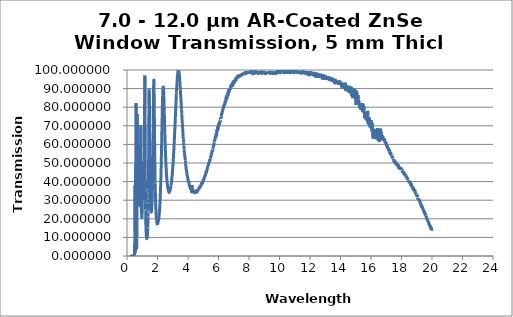
| Category | Transmission (%) |
|---|---|
| 0.2 | 0.006 |
| 0.201 | 0.006 |
| 0.202 | 0.005 |
| 0.203 | 0.004 |
| 0.204 | 0.001 |
| 0.205 | 0.002 |
| 0.206 | 0.003 |
| 0.207 | 0.002 |
| 0.208 | 0.004 |
| 0.209 | 0.002 |
| 0.21 | 0.001 |
| 0.211 | 0.003 |
| 0.212 | 0.003 |
| 0.213 | 0.003 |
| 0.214 | 0.004 |
| 0.215 | 0.002 |
| 0.216 | 0 |
| 0.217 | 0.002 |
| 0.218 | 0.004 |
| 0.219 | 0.003 |
| 0.22 | 0.004 |
| 0.221 | 0.002 |
| 0.222 | 0.001 |
| 0.223 | 0.001 |
| 0.224 | 0.001 |
| 0.225 | 0.001 |
| 0.226 | 0.003 |
| 0.227 | 0.002 |
| 0.228 | 0.001 |
| 0.229 | 0.001 |
| 0.23 | 0.003 |
| 0.231 | 0.004 |
| 0.232 | 0.004 |
| 0.233 | 0.001 |
| 0.234 | 0.001 |
| 0.235 | 0.001 |
| 0.236 | 0.002 |
| 0.237 | 0.002 |
| 0.238 | 0.004 |
| 0.239 | 0.001 |
| 0.24 | 0.002 |
| 0.241 | 0.001 |
| 0.242 | 0.002 |
| 0.243 | 0.002 |
| 0.244 | 0.004 |
| 0.245 | 0.001 |
| 0.246 | 0.001 |
| 0.247 | 0.001 |
| 0.248 | 0.003 |
| 0.249 | 0.003 |
| 0.25 | 0.004 |
| 0.251 | 0.001 |
| 0.252 | 0.001 |
| 0.253 | 0.001 |
| 0.254 | 0.001 |
| 0.255 | 0.002 |
| 0.256 | 0.004 |
| 0.257 | 0.001 |
| 0.258 | 0 |
| 0.259 | 0.001 |
| 0.26 | 0.003 |
| 0.261 | 0.004 |
| 0.262 | 0.004 |
| 0.263 | 0.002 |
| 0.264 | 0 |
| 0.265 | 0.002 |
| 0.266 | 0.002 |
| 0.267 | 0.002 |
| 0.268 | 0.003 |
| 0.269 | 0.001 |
| 0.27 | 0.001 |
| 0.271 | 0.001 |
| 0.272 | 0.001 |
| 0.273 | 0.003 |
| 0.274 | 0.003 |
| 0.275 | 0 |
| 0.276 | 0.002 |
| 0.277 | 0.001 |
| 0.278 | 0.002 |
| 0.279 | 0.003 |
| 0.28 | 0.003 |
| 0.281 | 0 |
| 0.282 | 0.001 |
| 0.283 | 0.001 |
| 0.284 | 0 |
| 0.285 | 0.002 |
| 0.286 | 0.003 |
| 0.287 | 0 |
| 0.288 | 0.001 |
| 0.289 | 0.001 |
| 0.29 | 0.001 |
| 0.291 | 0.002 |
| 0.292 | 0.002 |
| 0.293 | 0 |
| 0.294 | 0 |
| 0.295 | 0.001 |
| 0.296 | 0.001 |
| 0.297 | 0.002 |
| 0.298 | 0.003 |
| 0.299 | 0.002 |
| 0.3 | 0.001 |
| 0.301 | 0 |
| 0.302 | 0 |
| 0.303 | 0.003 |
| 0.304 | 0.003 |
| 0.305 | 0 |
| 0.306 | 0.001 |
| 0.307 | 0.001 |
| 0.308 | 0.001 |
| 0.309 | 0.003 |
| 0.31 | 0.003 |
| 0.311 | 0.001 |
| 0.312 | 0 |
| 0.313 | 0.001 |
| 0.314 | 0.001 |
| 0.315 | 0.002 |
| 0.316 | 0.003 |
| 0.317 | 0.002 |
| 0.318 | 0.001 |
| 0.319 | 0.001 |
| 0.32 | 0.002 |
| 0.321 | 0.002 |
| 0.322 | 0.003 |
| 0.323 | 0.003 |
| 0.324 | 0.001 |
| 0.325 | 0.001 |
| 0.326 | 0.002 |
| 0.327 | 0.003 |
| 0.328 | 0.004 |
| 0.329 | 0.003 |
| 0.33 | 0.001 |
| 0.331 | 0.001 |
| 0.332 | 0.002 |
| 0.333 | 0.003 |
| 0.334 | 0.003 |
| 0.335 | 0.003 |
| 0.336 | 0 |
| 0.337 | 0.002 |
| 0.338 | 0.002 |
| 0.339 | 0.002 |
| 0.34 | 0.003 |
| 0.341 | 0.003 |
| 0.342 | 0 |
| 0.343 | 0 |
| 0.344 | 0.002 |
| 0.345 | 0.003 |
| 0.346 | 0.003 |
| 0.347 | 0.002 |
| 0.348 | 0 |
| 0.349 | 0.001 |
| 0.35 | 0.002 |
| 0.351 | 0.003 |
| 0.352 | 0.003 |
| 0.353 | 0.003 |
| 0.354 | 0.001 |
| 0.355 | 0.001 |
| 0.356 | 0.001 |
| 0.357 | 0.003 |
| 0.358 | 0.003 |
| 0.359 | 0.003 |
| 0.36 | 0.001 |
| 0.361 | 0.002 |
| 0.362 | 0.001 |
| 0.363 | 0.001 |
| 0.364 | 0.002 |
| 0.365 | 0.002 |
| 0.366 | 0.001 |
| 0.367 | 0.001 |
| 0.368 | 0.002 |
| 0.369 | 0.002 |
| 0.37 | 0.001 |
| 0.371 | 0.002 |
| 0.372 | 0.001 |
| 0.373 | 0.001 |
| 0.374 | 0.001 |
| 0.375 | 0.001 |
| 0.376 | 0.001 |
| 0.377 | 0 |
| 0.378 | 0.001 |
| 0.379 | 0.002 |
| 0.38 | 0.002 |
| 0.381 | 0.002 |
| 0.382 | 0.002 |
| 0.383 | 0.003 |
| 0.384 | 0.003 |
| 0.385 | 0.001 |
| 0.386 | 0.002 |
| 0.387 | 0.002 |
| 0.388 | 0.003 |
| 0.389 | 0.002 |
| 0.39 | 0.004 |
| 0.391 | 0.001 |
| 0.392 | 0.003 |
| 0.393 | 0.002 |
| 0.394 | 0.002 |
| 0.395 | 0.004 |
| 0.396 | 0.001 |
| 0.397 | 0.001 |
| 0.398 | 0.002 |
| 0.399 | 0.003 |
| 0.4 | 0.003 |
| 0.401 | 0.004 |
| 0.402 | 0.003 |
| 0.403 | 0.001 |
| 0.404 | 0.002 |
| 0.405 | 0.003 |
| 0.406 | 0.002 |
| 0.407 | 0.004 |
| 0.408 | 0.002 |
| 0.409 | 0.002 |
| 0.41 | 0.001 |
| 0.411 | 0.003 |
| 0.412 | 0.003 |
| 0.413 | 0.004 |
| 0.414 | 0.003 |
| 0.415 | 0 |
| 0.416 | 0.003 |
| 0.417 | 0.003 |
| 0.418 | 0.003 |
| 0.419 | 0.001 |
| 0.42 | 0.002 |
| 0.421 | 0.003 |
| 0.422 | 0.003 |
| 0.423 | 0.003 |
| 0.424 | 0 |
| 0.425 | 0.003 |
| 0.426 | 0.003 |
| 0.427 | 0.003 |
| 0.428 | 0.002 |
| 0.429 | 0.001 |
| 0.43 | 0.003 |
| 0.431 | 0.001 |
| 0.432 | 0.003 |
| 0.433 | 0.003 |
| 0.434 | 0.003 |
| 0.435 | 0 |
| 0.436 | 0.002 |
| 0.437 | 0.002 |
| 0.438 | 0.003 |
| 0.439 | 0.002 |
| 0.44 | 0 |
| 0.441 | 0.001 |
| 0.442 | 0.003 |
| 0.443 | 0.003 |
| 0.444 | 0.003 |
| 0.445 | 0.003 |
| 0.446 | 0.001 |
| 0.447 | 0.001 |
| 0.448 | 0.003 |
| 0.449 | 0 |
| 0.45 | 0.005 |
| 0.451 | 0.003 |
| 0.452 | 0.001 |
| 0.453 | 0 |
| 0.454 | 0.002 |
| 0.455 | 0.003 |
| 0.456 | 0.001 |
| 0.457 | 0.003 |
| 0.458 | 0.003 |
| 0.459 | 0.001 |
| 0.46 | 0 |
| 0.461 | 0.002 |
| 0.462 | 0.002 |
| 0.463 | 0.003 |
| 0.464 | 0.004 |
| 0.465 | 0.001 |
| 0.466 | 0.001 |
| 0.467 | 0.002 |
| 0.468 | 0.001 |
| 0.469 | 0.003 |
| 0.47 | 0.003 |
| 0.471 | 0 |
| 0.472 | 0 |
| 0.473 | 0.002 |
| 0.474 | 0.002 |
| 0.475 | 0.005 |
| 0.476 | 0.03 |
| 0.477 | 0.09 |
| 0.478 | 0.181 |
| 0.479 | 0.305 |
| 0.48 | 0.431 |
| 0.481 | 0.544 |
| 0.482 | 0.633 |
| 0.483 | 0.702 |
| 0.484 | 0.751 |
| 0.485 | 0.799 |
| 0.486 | 0.851 |
| 0.487 | 0.924 |
| 0.488 | 1.026 |
| 0.489 | 1.175 |
| 0.49 | 1.38 |
| 0.491 | 1.66 |
| 0.492 | 2.038 |
| 0.493 | 2.54 |
| 0.494 | 3.173 |
| 0.495 | 3.955 |
| 0.496 | 4.812 |
| 0.497 | 5.629 |
| 0.498 | 6.212 |
| 0.499 | 6.403 |
| 0.5 | 6.164 |
| 0.501 | 5.6 |
| 0.502 | 4.881 |
| 0.503 | 4.153 |
| 0.504 | 3.496 |
| 0.505 | 2.946 |
| 0.506 | 2.516 |
| 0.507 | 2.196 |
| 0.508 | 1.962 |
| 0.509 | 1.806 |
| 0.51 | 1.718 |
| 0.511 | 1.685 |
| 0.512 | 1.708 |
| 0.513 | 1.79 |
| 0.514 | 1.932 |
| 0.515 | 2.153 |
| 0.516 | 2.486 |
| 0.517 | 2.969 |
| 0.518 | 3.67 |
| 0.519 | 4.672 |
| 0.52 | 6.086 |
| 0.521 | 8.087 |
| 0.522 | 10.86 |
| 0.523 | 14.652 |
| 0.524 | 19.672 |
| 0.525 | 25.767 |
| 0.526 | 32.054 |
| 0.527 | 36.795 |
| 0.528 | 37.983 |
| 0.529 | 35.077 |
| 0.53 | 29.457 |
| 0.531 | 23.232 |
| 0.532 | 17.824 |
| 0.533 | 13.575 |
| 0.534 | 10.411 |
| 0.535 | 8.117 |
| 0.536 | 6.443 |
| 0.537 | 5.235 |
| 0.538 | 4.359 |
| 0.539 | 3.716 |
| 0.54 | 3.243 |
| 0.541 | 2.895 |
| 0.542 | 2.649 |
| 0.543 | 2.47 |
| 0.544 | 2.347 |
| 0.545 | 2.268 |
| 0.546 | 2.231 |
| 0.547 | 2.227 |
| 0.548 | 2.268 |
| 0.549 | 2.345 |
| 0.55 | 2.46 |
| 0.551 | 2.614 |
| 0.552 | 2.818 |
| 0.553 | 3.072 |
| 0.554 | 3.394 |
| 0.555 | 3.802 |
| 0.556 | 4.319 |
| 0.557 | 4.956 |
| 0.558 | 5.762 |
| 0.559 | 6.773 |
| 0.56 | 8.029 |
| 0.561 | 9.621 |
| 0.562 | 11.665 |
| 0.563 | 14.076 |
| 0.564 | 17.033 |
| 0.565 | 20.629 |
| 0.566 | 24.969 |
| 0.567 | 29.857 |
| 0.568 | 35.098 |
| 0.569 | 40.227 |
| 0.57 | 44.566 |
| 0.571 | 47.628 |
| 0.572 | 49.14 |
| 0.573 | 49.115 |
| 0.574 | 47.881 |
| 0.575 | 45.866 |
| 0.576 | 43.441 |
| 0.577 | 40.967 |
| 0.578 | 38.719 |
| 0.579 | 36.822 |
| 0.58 | 35.337 |
| 0.581 | 34.315 |
| 0.582 | 33.724 |
| 0.583 | 33.555 |
| 0.584 | 33.825 |
| 0.585 | 34.541 |
| 0.586 | 35.776 |
| 0.587 | 37.576 |
| 0.588 | 39.992 |
| 0.589 | 43.087 |
| 0.59 | 46.945 |
| 0.591 | 51.562 |
| 0.592 | 56.856 |
| 0.593 | 62.759 |
| 0.594 | 68.961 |
| 0.595 | 74.911 |
| 0.596 | 79.765 |
| 0.597 | 82.272 |
| 0.598 | 81.669 |
| 0.599 | 77.803 |
| 0.6 | 71.18 |
| 0.601 | 63.029 |
| 0.602 | 54.594 |
| 0.603 | 46.466 |
| 0.604 | 39.169 |
| 0.605 | 32.933 |
| 0.606 | 27.648 |
| 0.607 | 23.298 |
| 0.608 | 19.774 |
| 0.609 | 16.899 |
| 0.61 | 14.567 |
| 0.611 | 12.699 |
| 0.612 | 11.179 |
| 0.613 | 9.924 |
| 0.614 | 8.885 |
| 0.615 | 8.012 |
| 0.616 | 7.278 |
| 0.617 | 6.659 |
| 0.618 | 6.137 |
| 0.619 | 5.704 |
| 0.62 | 5.346 |
| 0.621 | 5.048 |
| 0.622 | 4.806 |
| 0.623 | 4.609 |
| 0.624 | 4.446 |
| 0.625 | 4.316 |
| 0.626 | 4.217 |
| 0.627 | 4.146 |
| 0.628 | 4.107 |
| 0.629 | 4.094 |
| 0.63 | 4.1 |
| 0.631 | 4.134 |
| 0.632 | 4.193 |
| 0.633 | 4.273 |
| 0.634 | 4.381 |
| 0.635 | 4.517 |
| 0.636 | 4.682 |
| 0.637 | 4.88 |
| 0.638 | 5.113 |
| 0.639 | 5.382 |
| 0.64 | 5.69 |
| 0.641 | 6.044 |
| 0.642 | 6.439 |
| 0.643 | 6.889 |
| 0.644 | 7.404 |
| 0.645 | 7.99 |
| 0.646 | 8.667 |
| 0.647 | 9.443 |
| 0.648 | 10.326 |
| 0.649 | 11.329 |
| 0.65 | 12.467 |
| 0.651 | 13.737 |
| 0.652 | 15.154 |
| 0.653 | 16.756 |
| 0.654 | 18.578 |
| 0.655 | 20.654 |
| 0.656 | 22.999 |
| 0.657 | 25.643 |
| 0.658 | 28.604 |
| 0.659 | 31.864 |
| 0.66 | 35.425 |
| 0.661 | 39.256 |
| 0.662 | 43.249 |
| 0.663 | 47.378 |
| 0.664 | 51.669 |
| 0.665 | 56.009 |
| 0.666 | 60.218 |
| 0.667 | 64.193 |
| 0.668 | 67.758 |
| 0.669 | 70.726 |
| 0.67 | 73.103 |
| 0.671 | 74.819 |
| 0.672 | 75.867 |
| 0.673 | 76.372 |
| 0.674 | 76.359 |
| 0.675 | 75.852 |
| 0.676 | 75.042 |
| 0.677 | 73.971 |
| 0.678 | 72.678 |
| 0.679 | 71.33 |
| 0.68 | 69.934 |
| 0.681 | 68.517 |
| 0.682 | 67.189 |
| 0.683 | 65.935 |
| 0.684 | 64.729 |
| 0.685 | 63.616 |
| 0.686 | 62.559 |
| 0.687 | 61.517 |
| 0.688 | 60.586 |
| 0.689 | 59.727 |
| 0.69 | 58.919 |
| 0.691 | 58.162 |
| 0.692 | 57.437 |
| 0.693 | 56.725 |
| 0.694 | 56.01 |
| 0.695 | 55.306 |
| 0.696 | 54.591 |
| 0.697 | 53.804 |
| 0.698 | 53.015 |
| 0.699 | 52.192 |
| 0.7 | 51.31 |
| 0.701 | 50.432 |
| 0.702 | 49.54 |
| 0.703 | 48.583 |
| 0.704 | 47.609 |
| 0.705 | 46.595 |
| 0.706 | 45.519 |
| 0.707 | 44.463 |
| 0.708 | 43.407 |
| 0.709 | 42.323 |
| 0.71 | 41.275 |
| 0.711 | 40.25 |
| 0.712 | 39.251 |
| 0.713 | 38.296 |
| 0.714 | 37.368 |
| 0.715 | 36.433 |
| 0.716 | 35.555 |
| 0.717 | 34.721 |
| 0.718 | 33.907 |
| 0.719 | 33.173 |
| 0.72 | 32.488 |
| 0.721 | 31.852 |
| 0.722 | 31.277 |
| 0.723 | 30.755 |
| 0.724 | 30.266 |
| 0.725 | 29.835 |
| 0.726 | 29.452 |
| 0.727 | 29.102 |
| 0.728 | 28.824 |
| 0.729 | 28.582 |
| 0.73 | 28.391 |
| 0.731 | 28.266 |
| 0.732 | 28.172 |
| 0.733 | 28.129 |
| 0.734 | 28.135 |
| 0.735 | 28.184 |
| 0.736 | 28.28 |
| 0.737 | 28.434 |
| 0.738 | 28.631 |
| 0.739 | 28.865 |
| 0.74 | 29.166 |
| 0.741 | 29.497 |
| 0.742 | 29.866 |
| 0.743 | 30.305 |
| 0.744 | 30.77 |
| 0.745 | 31.289 |
| 0.746 | 31.878 |
| 0.747 | 32.512 |
| 0.748 | 33.189 |
| 0.749 | 33.921 |
| 0.75 | 34.686 |
| 0.751 | 35.478 |
| 0.752 | 36.317 |
| 0.753 | 37.188 |
| 0.754 | 38.099 |
| 0.755 | 39.072 |
| 0.756 | 40.078 |
| 0.757 | 41.089 |
| 0.758 | 42.149 |
| 0.759 | 43.209 |
| 0.76 | 44.255 |
| 0.761 | 45.332 |
| 0.762 | 46.356 |
| 0.763 | 47.341 |
| 0.764 | 48.327 |
| 0.765 | 49.278 |
| 0.766 | 50.182 |
| 0.767 | 51.032 |
| 0.768 | 51.812 |
| 0.769 | 52.498 |
| 0.77 | 53.122 |
| 0.771 | 53.627 |
| 0.772 | 54.011 |
| 0.773 | 54.317 |
| 0.774 | 54.526 |
| 0.775 | 54.603 |
| 0.776 | 54.622 |
| 0.777 | 54.519 |
| 0.778 | 54.304 |
| 0.779 | 54.016 |
| 0.78 | 53.639 |
| 0.781 | 53.186 |
| 0.782 | 52.676 |
| 0.783 | 52.128 |
| 0.784 | 51.501 |
| 0.785 | 50.851 |
| 0.786 | 50.13 |
| 0.787 | 49.374 |
| 0.788 | 48.649 |
| 0.789 | 47.866 |
| 0.79 | 47.059 |
| 0.791 | 46.32 |
| 0.792 | 45.564 |
| 0.793 | 44.796 |
| 0.794 | 44.075 |
| 0.795 | 43.306 |
| 0.796 | 42.569 |
| 0.797 | 41.866 |
| 0.798 | 41.142 |
| 0.799 | 40.46 |
| 0.8 | 39.821 |
| 0.801 | 39.182 |
| 0.802 | 38.584 |
| 0.803 | 38 |
| 0.804 | 37.433 |
| 0.805 | 36.885 |
| 0.806 | 36.362 |
| 0.807 | 35.846 |
| 0.808 | 35.342 |
| 0.809 | 34.872 |
| 0.81 | 34.399 |
| 0.811 | 33.966 |
| 0.812 | 33.566 |
| 0.813 | 33.168 |
| 0.814 | 32.787 |
| 0.815 | 32.407 |
| 0.816 | 32.054 |
| 0.817 | 31.717 |
| 0.818 | 31.379 |
| 0.819 | 31.065 |
| 0.82 | 30.775 |
| 0.821 | 30.479 |
| 0.822 | 30.2 |
| 0.823 | 29.935 |
| 0.824 | 29.702 |
| 0.825 | 29.453 |
| 0.826 | 29.225 |
| 0.827 | 28.983 |
| 0.828 | 28.771 |
| 0.829 | 28.577 |
| 0.83 | 28.393 |
| 0.831 | 28.226 |
| 0.832 | 28.046 |
| 0.833 | 27.876 |
| 0.834 | 27.712 |
| 0.835 | 27.601 |
| 0.836 | 27.486 |
| 0.837 | 27.369 |
| 0.838 | 27.272 |
| 0.839 | 27.18 |
| 0.84 | 27.112 |
| 0.841 | 27.043 |
| 0.842 | 27.002 |
| 0.843 | 26.946 |
| 0.844 | 26.932 |
| 0.845 | 26.941 |
| 0.846 | 26.922 |
| 0.847 | 26.923 |
| 0.848 | 26.988 |
| 0.849 | 27.033 |
| 0.85 | 27.102 |
| 0.851 | 27.197 |
| 0.852 | 27.273 |
| 0.853 | 27.389 |
| 0.854 | 27.575 |
| 0.855 | 27.712 |
| 0.856 | 27.878 |
| 0.857 | 28.088 |
| 0.858 | 28.306 |
| 0.859 | 28.589 |
| 0.86 | 29.36 |
| 0.861 | 29.655 |
| 0.862 | 29.957 |
| 0.863 | 30.309 |
| 0.864 | 30.688 |
| 0.865 | 31.112 |
| 0.866 | 31.592 |
| 0.867 | 32.101 |
| 0.868 | 32.616 |
| 0.869 | 33.11 |
| 0.87 | 33.713 |
| 0.871 | 34.322 |
| 0.872 | 35.004 |
| 0.873 | 35.699 |
| 0.874 | 36.446 |
| 0.875 | 37.212 |
| 0.876 | 38.054 |
| 0.877 | 38.917 |
| 0.878 | 39.877 |
| 0.879 | 40.814 |
| 0.88 | 41.828 |
| 0.881 | 42.865 |
| 0.882 | 43.969 |
| 0.883 | 45.105 |
| 0.884 | 46.31 |
| 0.885 | 47.526 |
| 0.886 | 48.785 |
| 0.887 | 50.078 |
| 0.888 | 51.287 |
| 0.889 | 52.593 |
| 0.89 | 53.976 |
| 0.891 | 55.303 |
| 0.892 | 56.677 |
| 0.893 | 58.054 |
| 0.894 | 59.421 |
| 0.895 | 60.694 |
| 0.896 | 62 |
| 0.897 | 63.212 |
| 0.898 | 64.428 |
| 0.899 | 65.543 |
| 0.9 | 66.614 |
| 0.901 | 67.49 |
| 0.902 | 68.332 |
| 0.903 | 69.046 |
| 0.904 | 69.587 |
| 0.905 | 70 |
| 0.906 | 70.261 |
| 0.907 | 70.366 |
| 0.908 | 70.293 |
| 0.909 | 70.018 |
| 0.91 | 69.578 |
| 0.911 | 69.008 |
| 0.912 | 68.238 |
| 0.913 | 67.296 |
| 0.914 | 66.308 |
| 0.915 | 65.15 |
| 0.916 | 63.803 |
| 0.917 | 62.527 |
| 0.918 | 61.103 |
| 0.919 | 59.551 |
| 0.92 | 58.065 |
| 0.921 | 56.506 |
| 0.922 | 54.924 |
| 0.923 | 53.313 |
| 0.924 | 51.777 |
| 0.925 | 50.235 |
| 0.926 | 48.803 |
| 0.927 | 47.344 |
| 0.928 | 45.825 |
| 0.929 | 44.477 |
| 0.93 | 43.199 |
| 0.931 | 41.947 |
| 0.932 | 40.672 |
| 0.933 | 39.516 |
| 0.934 | 38.322 |
| 0.935 | 37.205 |
| 0.936 | 36.18 |
| 0.937 | 35.21 |
| 0.938 | 34.255 |
| 0.939 | 33.314 |
| 0.94 | 32.445 |
| 0.941 | 31.64 |
| 0.942 | 30.827 |
| 0.943 | 30.095 |
| 0.944 | 29.336 |
| 0.945 | 28.648 |
| 0.946 | 28.026 |
| 0.947 | 27.424 |
| 0.948 | 26.818 |
| 0.949 | 26.275 |
| 0.95 | 25.764 |
| 0.951 | 25.282 |
| 0.952 | 24.817 |
| 0.953 | 24.388 |
| 0.954 | 23.979 |
| 0.955 | 23.623 |
| 0.956 | 23.275 |
| 0.957 | 22.969 |
| 0.958 | 22.653 |
| 0.959 | 22.367 |
| 0.96 | 22.128 |
| 0.961 | 21.887 |
| 0.962 | 21.67 |
| 0.963 | 21.49 |
| 0.964 | 21.322 |
| 0.965 | 21.143 |
| 0.966 | 20.996 |
| 0.967 | 20.889 |
| 0.968 | 20.82 |
| 0.969 | 20.752 |
| 0.97 | 20.66 |
| 0.971 | 20.598 |
| 0.972 | 20.57 |
| 0.973 | 20.565 |
| 0.974 | 20.551 |
| 0.975 | 20.571 |
| 0.976 | 20.608 |
| 0.977 | 20.635 |
| 0.978 | 20.681 |
| 0.979 | 20.753 |
| 0.98 | 20.85 |
| 0.981 | 20.931 |
| 0.982 | 21.032 |
| 0.983 | 21.172 |
| 0.984 | 21.342 |
| 0.985 | 21.497 |
| 0.986 | 21.662 |
| 0.987 | 21.866 |
| 0.988 | 22.097 |
| 0.989 | 22.304 |
| 0.99 | 22.535 |
| 0.991 | 22.779 |
| 0.992 | 23.079 |
| 0.993 | 23.403 |
| 0.994 | 23.701 |
| 0.995 | 24.038 |
| 0.996 | 24.413 |
| 0.997 | 24.775 |
| 0.998 | 25.159 |
| 0.999 | 25.555 |
| 1.0 | 25.997 |
| 1.001 | 26.463 |
| 1.002 | 26.903 |
| 1.003 | 27.365 |
| 1.004 | 27.845 |
| 1.005 | 28.342 |
| 1.006 | 28.887 |
| 1.007 | 29.461 |
| 1.008 | 30.014 |
| 1.009 | 30.582 |
| 1.01 | 31.171 |
| 1.011 | 31.771 |
| 1.012 | 32.413 |
| 1.013 | 33.069 |
| 1.014 | 33.709 |
| 1.015 | 34.366 |
| 1.016 | 35.025 |
| 1.017 | 35.704 |
| 1.018 | 36.436 |
| 1.019 | 37.159 |
| 1.02 | 37.865 |
| 1.021 | 38.601 |
| 1.022 | 39.33 |
| 1.023 | 40.05 |
| 1.024 | 40.794 |
| 1.025 | 41.547 |
| 1.026 | 42.27 |
| 1.027 | 42.971 |
| 1.028 | 43.653 |
| 1.029 | 44.327 |
| 1.03 | 44.973 |
| 1.031 | 45.624 |
| 1.032 | 46.27 |
| 1.033 | 46.84 |
| 1.034 | 47.383 |
| 1.035 | 47.889 |
| 1.036 | 48.345 |
| 1.037 | 48.773 |
| 1.038 | 49.174 |
| 1.039 | 49.488 |
| 1.04 | 49.743 |
| 1.041 | 49.976 |
| 1.042 | 50.153 |
| 1.043 | 50.274 |
| 1.044 | 50.354 |
| 1.045 | 50.385 |
| 1.046 | 50.374 |
| 1.047 | 50.306 |
| 1.048 | 50.179 |
| 1.049 | 50.02 |
| 1.05 | 49.82 |
| 1.051 | 49.581 |
| 1.052 | 49.317 |
| 1.053 | 49.025 |
| 1.054 | 48.698 |
| 1.055 | 48.321 |
| 1.056 | 47.923 |
| 1.057 | 47.534 |
| 1.058 | 47.13 |
| 1.059 | 46.699 |
| 1.06 | 46.239 |
| 1.061 | 45.757 |
| 1.062 | 45.278 |
| 1.063 | 44.799 |
| 1.064 | 44.315 |
| 1.065 | 43.821 |
| 1.066 | 43.319 |
| 1.067 | 42.835 |
| 1.068 | 42.376 |
| 1.069 | 41.905 |
| 1.07 | 41.432 |
| 1.071 | 40.971 |
| 1.072 | 40.513 |
| 1.073 | 40.056 |
| 1.074 | 39.621 |
| 1.075 | 39.194 |
| 1.076 | 38.802 |
| 1.077 | 38.436 |
| 1.078 | 38.075 |
| 1.079 | 37.719 |
| 1.08 | 37.381 |
| 1.081 | 37.046 |
| 1.082 | 36.74 |
| 1.083 | 36.454 |
| 1.084 | 36.17 |
| 1.085 | 35.918 |
| 1.086 | 35.725 |
| 1.087 | 35.525 |
| 1.088 | 35.327 |
| 1.089 | 35.145 |
| 1.09 | 34.985 |
| 1.091 | 34.835 |
| 1.092 | 34.7 |
| 1.093 | 34.587 |
| 1.094 | 34.508 |
| 1.095 | 34.463 |
| 1.096 | 34.424 |
| 1.097 | 34.379 |
| 1.098 | 34.358 |
| 1.099 | 34.358 |
| 1.1 | 34.375 |
| 1.101 | 34.4 |
| 1.102 | 34.454 |
| 1.103 | 34.524 |
| 1.104 | 34.649 |
| 1.105 | 34.781 |
| 1.106 | 34.93 |
| 1.107 | 35.091 |
| 1.108 | 35.268 |
| 1.109 | 35.467 |
| 1.11 | 35.683 |
| 1.111 | 35.935 |
| 1.112 | 36.217 |
| 1.113 | 36.517 |
| 1.114 | 36.83 |
| 1.115 | 37.173 |
| 1.116 | 37.588 |
| 1.117 | 38.013 |
| 1.118 | 38.433 |
| 1.119 | 38.888 |
| 1.12 | 39.386 |
| 1.121 | 39.911 |
| 1.122 | 40.445 |
| 1.123 | 41.016 |
| 1.124 | 41.617 |
| 1.125 | 42.25 |
| 1.126 | 42.906 |
| 1.127 | 43.638 |
| 1.128 | 44.385 |
| 1.129 | 45.158 |
| 1.13 | 45.9 |
| 1.131 | 46.713 |
| 1.132 | 47.606 |
| 1.133 | 48.503 |
| 1.134 | 49.493 |
| 1.135 | 50.51 |
| 1.136 | 51.497 |
| 1.137 | 52.665 |
| 1.138 | 53.82 |
| 1.139 | 54.995 |
| 1.14 | 56.219 |
| 1.141 | 57.499 |
| 1.142 | 58.798 |
| 1.143 | 60.19 |
| 1.144 | 61.611 |
| 1.145 | 63.072 |
| 1.146 | 64.617 |
| 1.147 | 66.192 |
| 1.148 | 67.785 |
| 1.149 | 69.454 |
| 1.15 | 71.114 |
| 1.151 | 72.855 |
| 1.152 | 74.542 |
| 1.153 | 76.382 |
| 1.154 | 78.135 |
| 1.155 | 79.929 |
| 1.156 | 81.637 |
| 1.157 | 83.407 |
| 1.158 | 85.074 |
| 1.159 | 86.713 |
| 1.16 | 88.26 |
| 1.161 | 89.76 |
| 1.162 | 91.138 |
| 1.163 | 92.455 |
| 1.164 | 93.576 |
| 1.165 | 94.604 |
| 1.166 | 95.457 |
| 1.167 | 96.142 |
| 1.168 | 96.641 |
| 1.169 | 96.955 |
| 1.17 | 97.097 |
| 1.171 | 97.033 |
| 1.172 | 96.763 |
| 1.173 | 96.339 |
| 1.174 | 95.718 |
| 1.175 | 94.866 |
| 1.176 | 93.875 |
| 1.177 | 92.699 |
| 1.178 | 91.376 |
| 1.179 | 89.889 |
| 1.18 | 88.308 |
| 1.181 | 86.561 |
| 1.182 | 84.708 |
| 1.183 | 82.734 |
| 1.184 | 80.757 |
| 1.185 | 78.643 |
| 1.186 | 76.541 |
| 1.187 | 74.318 |
| 1.188 | 72.189 |
| 1.189 | 70.066 |
| 1.19 | 67.76 |
| 1.191 | 65.567 |
| 1.192 | 63.547 |
| 1.193 | 61.414 |
| 1.194 | 59.406 |
| 1.195 | 57.401 |
| 1.196 | 55.486 |
| 1.197 | 53.562 |
| 1.198 | 51.709 |
| 1.199 | 50.003 |
| 1.2 | 48.257 |
| 1.201 | 46.554 |
| 1.202 | 45.089 |
| 1.203 | 43.502 |
| 1.204 | 42.137 |
| 1.205 | 40.716 |
| 1.206 | 39.386 |
| 1.207 | 38.119 |
| 1.208 | 36.936 |
| 1.209 | 35.755 |
| 1.21 | 34.681 |
| 1.211 | 33.603 |
| 1.212 | 32.579 |
| 1.213 | 31.599 |
| 1.214 | 30.665 |
| 1.215 | 29.749 |
| 1.216 | 28.935 |
| 1.217 | 28.053 |
| 1.218 | 27.263 |
| 1.219 | 26.528 |
| 1.22 | 25.834 |
| 1.221 | 25.075 |
| 1.222 | 24.411 |
| 1.223 | 23.758 |
| 1.224 | 23.142 |
| 1.225 | 22.541 |
| 1.226 | 21.976 |
| 1.227 | 21.415 |
| 1.228 | 20.899 |
| 1.229 | 20.381 |
| 1.23 | 19.919 |
| 1.231 | 19.449 |
| 1.232 | 18.982 |
| 1.233 | 18.557 |
| 1.234 | 18.152 |
| 1.235 | 17.733 |
| 1.236 | 17.361 |
| 1.237 | 17.014 |
| 1.238 | 16.665 |
| 1.239 | 16.318 |
| 1.24 | 15.986 |
| 1.241 | 15.693 |
| 1.242 | 15.409 |
| 1.243 | 15.12 |
| 1.244 | 14.855 |
| 1.245 | 14.598 |
| 1.246 | 14.353 |
| 1.247 | 14.113 |
| 1.248 | 13.888 |
| 1.249 | 13.661 |
| 1.25 | 13.409 |
| 1.251 | 13.217 |
| 1.252 | 13.015 |
| 1.253 | 12.838 |
| 1.254 | 12.656 |
| 1.255 | 12.445 |
| 1.256 | 12.298 |
| 1.257 | 12.143 |
| 1.258 | 12.013 |
| 1.259 | 11.861 |
| 1.26 | 11.707 |
| 1.261 | 11.536 |
| 1.262 | 11.418 |
| 1.263 | 11.303 |
| 1.264 | 11.186 |
| 1.265 | 11.057 |
| 1.266 | 10.91 |
| 1.267 | 10.809 |
| 1.268 | 10.708 |
| 1.269 | 10.613 |
| 1.27 | 10.523 |
| 1.271 | 10.441 |
| 1.272 | 10.355 |
| 1.273 | 10.271 |
| 1.274 | 10.19 |
| 1.275 | 10.104 |
| 1.276 | 10.038 |
| 1.277 | 9.955 |
| 1.278 | 9.892 |
| 1.279 | 9.847 |
| 1.28 | 9.832 |
| 1.281 | 9.767 |
| 1.282 | 9.719 |
| 1.283 | 9.663 |
| 1.284 | 9.618 |
| 1.285 | 9.568 |
| 1.286 | 9.531 |
| 1.287 | 9.499 |
| 1.288 | 9.463 |
| 1.289 | 9.427 |
| 1.29 | 9.401 |
| 1.291 | 9.37 |
| 1.292 | 9.349 |
| 1.293 | 9.337 |
| 1.294 | 9.32 |
| 1.295 | 9.308 |
| 1.296 | 9.298 |
| 1.297 | 9.289 |
| 1.298 | 9.293 |
| 1.299 | 9.296 |
| 1.3 | 9.304 |
| 1.301 | 9.293 |
| 1.302 | 9.275 |
| 1.303 | 9.285 |
| 1.304 | 9.309 |
| 1.305 | 9.339 |
| 1.306 | 9.36 |
| 1.307 | 9.357 |
| 1.308 | 9.348 |
| 1.309 | 9.372 |
| 1.31 | 9.412 |
| 1.311 | 9.459 |
| 1.312 | 9.497 |
| 1.313 | 9.547 |
| 1.314 | 9.589 |
| 1.315 | 9.604 |
| 1.316 | 9.618 |
| 1.317 | 9.669 |
| 1.318 | 9.718 |
| 1.319 | 9.771 |
| 1.32 | 9.825 |
| 1.321 | 9.886 |
| 1.322 | 9.953 |
| 1.323 | 10.01 |
| 1.324 | 10.072 |
| 1.325 | 10.138 |
| 1.326 | 10.211 |
| 1.327 | 10.284 |
| 1.328 | 10.37 |
| 1.329 | 10.459 |
| 1.33 | 10.545 |
| 1.331 | 10.637 |
| 1.332 | 10.71 |
| 1.333 | 10.767 |
| 1.334 | 10.866 |
| 1.335 | 10.976 |
| 1.336 | 11.085 |
| 1.337 | 11.186 |
| 1.338 | 11.276 |
| 1.339 | 11.369 |
| 1.34 | 11.5 |
| 1.341 | 11.639 |
| 1.342 | 11.785 |
| 1.343 | 11.928 |
| 1.344 | 12.048 |
| 1.345 | 12.146 |
| 1.346 | 12.297 |
| 1.347 | 12.492 |
| 1.348 | 12.674 |
| 1.349 | 12.804 |
| 1.35 | 12.916 |
| 1.351 | 13.057 |
| 1.352 | 13.231 |
| 1.353 | 13.473 |
| 1.354 | 13.745 |
| 1.355 | 13.976 |
| 1.356 | 14.143 |
| 1.357 | 14.26 |
| 1.358 | 14.361 |
| 1.359 | 14.532 |
| 1.36 | 14.846 |
| 1.361 | 15.221 |
| 1.362 | 15.494 |
| 1.363 | 15.694 |
| 1.364 | 15.934 |
| 1.365 | 16.177 |
| 1.366 | 16.445 |
| 1.367 | 16.739 |
| 1.368 | 17.024 |
| 1.369 | 17.308 |
| 1.37 | 17.646 |
| 1.371 | 18.022 |
| 1.372 | 18.34 |
| 1.373 | 18.64 |
| 1.374 | 18.991 |
| 1.375 | 19.372 |
| 1.376 | 19.716 |
| 1.377 | 19.989 |
| 1.378 | 20.235 |
| 1.379 | 20.598 |
| 1.38 | 21.057 |
| 1.381 | 21.571 |
| 1.382 | 22.129 |
| 1.383 | 22.647 |
| 1.384 | 23.063 |
| 1.385 | 23.466 |
| 1.386 | 23.975 |
| 1.387 | 24.606 |
| 1.388 | 25.235 |
| 1.389 | 25.75 |
| 1.39 | 26.228 |
| 1.391 | 26.796 |
| 1.392 | 27.404 |
| 1.393 | 28.027 |
| 1.394 | 28.783 |
| 1.395 | 29.632 |
| 1.396 | 30.3 |
| 1.397 | 30.868 |
| 1.398 | 31.56 |
| 1.399 | 32.444 |
| 1.4 | 33.407 |
| 1.401 | 34.168 |
| 1.402 | 34.893 |
| 1.403 | 35.778 |
| 1.404 | 36.718 |
| 1.405 | 37.662 |
| 1.406 | 38.587 |
| 1.407 | 39.535 |
| 1.408 | 40.567 |
| 1.409 | 41.621 |
| 1.41 | 42.593 |
| 1.411 | 43.596 |
| 1.412 | 44.648 |
| 1.413 | 45.793 |
| 1.414 | 47.001 |
| 1.415 | 48.153 |
| 1.416 | 49.338 |
| 1.417 | 50.592 |
| 1.418 | 51.872 |
| 1.419 | 53.174 |
| 1.42 | 54.484 |
| 1.421 | 55.768 |
| 1.422 | 57.117 |
| 1.423 | 58.53 |
| 1.424 | 59.928 |
| 1.425 | 61.341 |
| 1.426 | 62.776 |
| 1.427 | 64.215 |
| 1.428 | 65.634 |
| 1.429 | 67.068 |
| 1.43 | 68.54 |
| 1.431 | 70.012 |
| 1.432 | 71.461 |
| 1.433 | 72.868 |
| 1.434 | 74.266 |
| 1.435 | 75.634 |
| 1.436 | 76.967 |
| 1.437 | 78.251 |
| 1.438 | 79.495 |
| 1.439 | 80.666 |
| 1.44 | 81.793 |
| 1.441 | 82.853 |
| 1.442 | 83.847 |
| 1.443 | 84.795 |
| 1.444 | 85.653 |
| 1.445 | 86.423 |
| 1.446 | 87.113 |
| 1.447 | 87.665 |
| 1.448 | 88.158 |
| 1.449 | 88.583 |
| 1.45 | 88.885 |
| 1.451 | 89.125 |
| 1.452 | 89.263 |
| 1.453 | 89.312 |
| 1.454 | 89.274 |
| 1.455 | 89.12 |
| 1.456 | 88.908 |
| 1.457 | 88.597 |
| 1.458 | 88.199 |
| 1.459 | 87.751 |
| 1.46 | 87.198 |
| 1.461 | 86.569 |
| 1.462 | 85.882 |
| 1.463 | 85.112 |
| 1.464 | 84.282 |
| 1.465 | 83.426 |
| 1.466 | 82.495 |
| 1.467 | 81.523 |
| 1.468 | 80.495 |
| 1.469 | 79.454 |
| 1.47 | 78.37 |
| 1.471 | 77.253 |
| 1.472 | 76.099 |
| 1.473 | 74.979 |
| 1.474 | 73.794 |
| 1.475 | 72.627 |
| 1.476 | 71.428 |
| 1.477 | 70.253 |
| 1.478 | 69.101 |
| 1.479 | 67.945 |
| 1.48 | 66.781 |
| 1.481 | 65.623 |
| 1.482 | 64.482 |
| 1.483 | 63.357 |
| 1.484 | 62.242 |
| 1.485 | 61.171 |
| 1.486 | 60.12 |
| 1.487 | 59.094 |
| 1.488 | 58.07 |
| 1.489 | 57.087 |
| 1.49 | 56.099 |
| 1.491 | 55.145 |
| 1.492 | 54.219 |
| 1.493 | 53.296 |
| 1.494 | 52.376 |
| 1.495 | 51.531 |
| 1.496 | 50.639 |
| 1.497 | 49.782 |
| 1.498 | 48.971 |
| 1.499 | 48.165 |
| 1.5 | 47.384 |
| 1.501 | 46.628 |
| 1.502 | 45.88 |
| 1.503 | 45.164 |
| 1.504 | 44.425 |
| 1.505 | 43.714 |
| 1.506 | 43.025 |
| 1.507 | 42.379 |
| 1.508 | 41.74 |
| 1.509 | 41.111 |
| 1.51 | 40.516 |
| 1.511 | 39.869 |
| 1.512 | 39.281 |
| 1.513 | 38.742 |
| 1.514 | 38.194 |
| 1.515 | 37.681 |
| 1.516 | 37.178 |
| 1.517 | 36.636 |
| 1.518 | 36.14 |
| 1.519 | 35.673 |
| 1.52 | 35.22 |
| 1.521 | 34.793 |
| 1.522 | 34.373 |
| 1.523 | 33.969 |
| 1.524 | 33.574 |
| 1.525 | 33.143 |
| 1.526 | 32.76 |
| 1.527 | 32.407 |
| 1.528 | 32.04 |
| 1.529 | 31.718 |
| 1.53 | 31.399 |
| 1.531 | 31.086 |
| 1.532 | 30.78 |
| 1.533 | 30.494 |
| 1.534 | 30.207 |
| 1.535 | 29.932 |
| 1.536 | 29.661 |
| 1.537 | 29.353 |
| 1.538 | 29.078 |
| 1.539 | 28.831 |
| 1.54 | 28.581 |
| 1.541 | 28.351 |
| 1.542 | 28.126 |
| 1.543 | 27.923 |
| 1.544 | 27.708 |
| 1.545 | 27.51 |
| 1.546 | 27.307 |
| 1.547 | 27.128 |
| 1.548 | 26.929 |
| 1.549 | 26.709 |
| 1.55 | 26.52 |
| 1.551 | 26.358 |
| 1.552 | 26.19 |
| 1.553 | 26.054 |
| 1.554 | 25.901 |
| 1.555 | 25.762 |
| 1.556 | 25.574 |
| 1.557 | 25.436 |
| 1.558 | 25.315 |
| 1.559 | 25.197 |
| 1.56 | 25.096 |
| 1.561 | 24.997 |
| 1.562 | 24.871 |
| 1.563 | 24.74 |
| 1.564 | 24.653 |
| 1.565 | 24.566 |
| 1.566 | 24.49 |
| 1.567 | 24.419 |
| 1.568 | 24.329 |
| 1.569 | 24.227 |
| 1.57 | 24.153 |
| 1.571 | 24.098 |
| 1.572 | 24.049 |
| 1.573 | 24.009 |
| 1.574 | 23.972 |
| 1.575 | 23.922 |
| 1.576 | 23.836 |
| 1.577 | 23.795 |
| 1.578 | 23.759 |
| 1.579 | 23.733 |
| 1.58 | 23.707 |
| 1.581 | 23.687 |
| 1.582 | 23.679 |
| 1.583 | 23.646 |
| 1.584 | 23.604 |
| 1.585 | 23.586 |
| 1.586 | 23.587 |
| 1.587 | 23.59 |
| 1.588 | 23.582 |
| 1.589 | 23.603 |
| 1.59 | 23.612 |
| 1.591 | 23.624 |
| 1.592 | 23.642 |
| 1.593 | 23.672 |
| 1.594 | 23.687 |
| 1.595 | 23.727 |
| 1.596 | 23.77 |
| 1.597 | 23.803 |
| 1.598 | 23.842 |
| 1.599 | 23.902 |
| 1.6 | 23.962 |
| 1.601 | 24.002 |
| 1.602 | 24.009 |
| 1.603 | 24.07 |
| 1.604 | 24.116 |
| 1.605 | 24.19 |
| 1.606 | 24.244 |
| 1.607 | 24.311 |
| 1.608 | 24.39 |
| 1.609 | 24.478 |
| 1.61 | 24.578 |
| 1.611 | 24.674 |
| 1.612 | 24.736 |
| 1.613 | 24.838 |
| 1.614 | 24.933 |
| 1.615 | 25.033 |
| 1.616 | 25.137 |
| 1.617 | 25.246 |
| 1.618 | 25.36 |
| 1.619 | 25.486 |
| 1.62 | 25.618 |
| 1.621 | 25.748 |
| 1.622 | 25.907 |
| 1.623 | 26.018 |
| 1.624 | 26.11 |
| 1.625 | 26.247 |
| 1.626 | 26.415 |
| 1.627 | 26.571 |
| 1.628 | 26.741 |
| 1.629 | 26.912 |
| 1.63 | 27.083 |
| 1.631 | 27.245 |
| 1.632 | 27.394 |
| 1.633 | 27.581 |
| 1.634 | 27.779 |
| 1.635 | 27.979 |
| 1.636 | 28.187 |
| 1.637 | 28.4 |
| 1.638 | 28.605 |
| 1.639 | 28.82 |
| 1.64 | 29.02 |
| 1.641 | 29.241 |
| 1.642 | 29.481 |
| 1.643 | 29.74 |
| 1.644 | 29.981 |
| 1.645 | 30.213 |
| 1.646 | 30.419 |
| 1.647 | 30.68 |
| 1.648 | 30.947 |
| 1.649 | 31.21 |
| 1.65 | 31.486 |
| 1.651 | 31.765 |
| 1.652 | 32.065 |
| 1.653 | 32.367 |
| 1.654 | 32.668 |
| 1.655 | 32.94 |
| 1.656 | 33.223 |
| 1.657 | 33.555 |
| 1.658 | 33.865 |
| 1.659 | 34.203 |
| 1.66 | 34.558 |
| 1.661 | 34.901 |
| 1.662 | 35.256 |
| 1.663 | 35.611 |
| 1.664 | 35.976 |
| 1.665 | 36.354 |
| 1.666 | 36.736 |
| 1.667 | 37.14 |
| 1.668 | 37.573 |
| 1.669 | 37.978 |
| 1.67 | 38.473 |
| 1.671 | 38.912 |
| 1.672 | 39.362 |
| 1.673 | 39.844 |
| 1.674 | 40.304 |
| 1.675 | 40.746 |
| 1.676 | 41.246 |
| 1.677 | 41.744 |
| 1.678 | 42.261 |
| 1.679 | 42.786 |
| 1.68 | 43.318 |
| 1.681 | 43.859 |
| 1.682 | 44.405 |
| 1.683 | 44.931 |
| 1.684 | 45.476 |
| 1.685 | 46.042 |
| 1.686 | 46.625 |
| 1.687 | 47.208 |
| 1.688 | 47.813 |
| 1.689 | 48.412 |
| 1.69 | 49.042 |
| 1.691 | 49.66 |
| 1.692 | 50.282 |
| 1.693 | 50.903 |
| 1.694 | 51.568 |
| 1.695 | 52.213 |
| 1.696 | 52.911 |
| 1.697 | 53.594 |
| 1.698 | 54.309 |
| 1.699 | 55.015 |
| 1.7 | 55.764 |
| 1.701 | 56.477 |
| 1.702 | 57.222 |
| 1.703 | 57.954 |
| 1.704 | 58.715 |
| 1.705 | 59.495 |
| 1.706 | 60.309 |
| 1.707 | 61.109 |
| 1.708 | 61.946 |
| 1.709 | 62.751 |
| 1.71 | 63.604 |
| 1.711 | 64.46 |
| 1.712 | 65.303 |
| 1.713 | 66.153 |
| 1.714 | 67.05 |
| 1.715 | 67.881 |
| 1.716 | 68.746 |
| 1.717 | 69.599 |
| 1.718 | 70.452 |
| 1.719 | 71.326 |
| 1.72 | 72.211 |
| 1.721 | 73.083 |
| 1.722 | 73.971 |
| 1.723 | 74.848 |
| 1.724 | 75.705 |
| 1.725 | 76.566 |
| 1.726 | 77.406 |
| 1.727 | 78.26 |
| 1.728 | 79.116 |
| 1.729 | 79.914 |
| 1.73 | 80.702 |
| 1.731 | 81.519 |
| 1.732 | 82.297 |
| 1.733 | 83.062 |
| 1.734 | 83.828 |
| 1.735 | 84.553 |
| 1.736 | 85.301 |
| 1.737 | 86.02 |
| 1.738 | 86.733 |
| 1.739 | 87.425 |
| 1.74 | 88.078 |
| 1.741 | 88.692 |
| 1.742 | 89.275 |
| 1.743 | 89.856 |
| 1.744 | 90.391 |
| 1.745 | 90.911 |
| 1.746 | 91.447 |
| 1.747 | 91.924 |
| 1.748 | 92.367 |
| 1.749 | 92.763 |
| 1.75 | 93.129 |
| 1.751 | 93.454 |
| 1.752 | 93.729 |
| 1.753 | 93.957 |
| 1.754 | 94.163 |
| 1.755 | 94.329 |
| 1.756 | 94.463 |
| 1.757 | 94.543 |
| 1.758 | 94.581 |
| 1.759 | 94.584 |
| 1.76 | 94.568 |
| 1.761 | 94.496 |
| 1.762 | 94.344 |
| 1.763 | 94.18 |
| 1.764 | 93.988 |
| 1.765 | 93.748 |
| 1.766 | 93.468 |
| 1.767 | 93.169 |
| 1.768 | 92.821 |
| 1.769 | 92.444 |
| 1.77 | 92.047 |
| 1.771 | 91.608 |
| 1.772 | 91.128 |
| 1.773 | 90.631 |
| 1.774 | 90.113 |
| 1.775 | 89.572 |
| 1.776 | 88.997 |
| 1.777 | 88.405 |
| 1.778 | 87.775 |
| 1.779 | 87.122 |
| 1.78 | 86.436 |
| 1.781 | 85.73 |
| 1.782 | 84.989 |
| 1.783 | 84.262 |
| 1.784 | 83.531 |
| 1.785 | 82.742 |
| 1.786 | 81.932 |
| 1.787 | 81.126 |
| 1.788 | 80.296 |
| 1.789 | 79.477 |
| 1.79 | 78.685 |
| 1.791 | 77.84 |
| 1.792 | 76.955 |
| 1.793 | 76.113 |
| 1.794 | 75.251 |
| 1.795 | 74.385 |
| 1.796 | 73.542 |
| 1.797 | 72.673 |
| 1.798 | 71.801 |
| 1.799 | 70.957 |
| 1.8 | 70.08 |
| 1.801 | 69.251 |
| 1.802 | 68.402 |
| 1.803 | 67.553 |
| 1.804 | 66.751 |
| 1.805 | 65.951 |
| 1.806 | 65.155 |
| 1.807 | 64.335 |
| 1.808 | 63.552 |
| 1.809 | 62.821 |
| 1.81 | 62.05 |
| 1.811 | 61.234 |
| 1.812 | 60.448 |
| 1.813 | 59.706 |
| 1.814 | 58.989 |
| 1.815 | 58.268 |
| 1.816 | 57.522 |
| 1.817 | 56.794 |
| 1.818 | 56.078 |
| 1.819 | 55.417 |
| 1.82 | 54.782 |
| 1.821 | 54.071 |
| 1.822 | 53.338 |
| 1.823 | 52.645 |
| 1.824 | 51.968 |
| 1.825 | 51.277 |
| 1.826 | 50.61 |
| 1.827 | 49.978 |
| 1.828 | 49.375 |
| 1.829 | 48.765 |
| 1.83 | 48.141 |
| 1.831 | 47.551 |
| 1.832 | 46.951 |
| 1.833 | 46.352 |
| 1.834 | 45.806 |
| 1.835 | 45.255 |
| 1.836 | 44.657 |
| 1.837 | 44.056 |
| 1.838 | 43.537 |
| 1.839 | 43.067 |
| 1.84 | 42.62 |
| 1.841 | 42.126 |
| 1.842 | 41.573 |
| 1.843 | 41.007 |
| 1.844 | 40.487 |
| 1.845 | 40.005 |
| 1.846 | 39.631 |
| 1.847 | 39.306 |
| 1.848 | 38.882 |
| 1.849 | 38.433 |
| 1.85 | 37.956 |
| 1.851 | 37.496 |
| 1.852 | 37.11 |
| 1.853 | 36.732 |
| 1.854 | 36.335 |
| 1.855 | 35.944 |
| 1.856 | 35.565 |
| 1.857 | 35.156 |
| 1.858 | 34.799 |
| 1.859 | 34.488 |
| 1.86 | 34.192 |
| 1.861 | 33.859 |
| 1.862 | 33.514 |
| 1.863 | 33.153 |
| 1.864 | 32.794 |
| 1.865 | 32.434 |
| 1.866 | 32.067 |
| 1.867 | 31.693 |
| 1.868 | 31.379 |
| 1.869 | 31.104 |
| 1.87 | 30.821 |
| 1.871 | 30.52 |
| 1.872 | 30.261 |
| 1.873 | 29.985 |
| 1.874 | 29.709 |
| 1.875 | 29.456 |
| 1.876 | 29.253 |
| 1.877 | 29.01 |
| 1.878 | 28.724 |
| 1.879 | 28.398 |
| 1.88 | 28.11 |
| 1.881 | 27.878 |
| 1.882 | 27.668 |
| 1.883 | 27.456 |
| 1.884 | 27.232 |
| 1.885 | 27.01 |
| 1.886 | 26.806 |
| 1.887 | 26.517 |
| 1.888 | 26.264 |
| 1.889 | 26.061 |
| 1.89 | 25.9 |
| 1.891 | 25.769 |
| 1.892 | 25.646 |
| 1.893 | 25.468 |
| 1.894 | 25.237 |
| 1.895 | 24.984 |
| 1.896 | 24.764 |
| 1.897 | 24.583 |
| 1.898 | 24.427 |
| 1.899 | 24.283 |
| 1.9 | 24.11 |
| 1.901 | 23.891 |
| 1.902 | 23.685 |
| 1.903 | 23.514 |
| 1.904 | 23.398 |
| 1.905 | 23.325 |
| 1.906 | 23.2 |
| 1.907 | 23.017 |
| 1.908 | 22.834 |
| 1.909 | 22.627 |
| 1.91 | 22.449 |
| 1.911 | 22.33 |
| 1.912 | 22.253 |
| 1.913 | 22.162 |
| 1.914 | 22.03 |
| 1.915 | 21.882 |
| 1.916 | 21.695 |
| 1.917 | 21.493 |
| 1.918 | 21.34 |
| 1.919 | 21.249 |
| 1.92 | 21.161 |
| 1.921 | 21.086 |
| 1.922 | 20.99 |
| 1.923 | 20.847 |
| 1.924 | 20.702 |
| 1.925 | 20.585 |
| 1.926 | 20.479 |
| 1.927 | 20.409 |
| 1.928 | 20.344 |
| 1.929 | 20.254 |
| 1.93 | 20.159 |
| 1.931 | 20.05 |
| 1.932 | 19.938 |
| 1.933 | 19.837 |
| 1.934 | 19.749 |
| 1.935 | 19.661 |
| 1.936 | 19.585 |
| 1.937 | 19.486 |
| 1.938 | 19.416 |
| 1.939 | 19.324 |
| 1.94 | 19.247 |
| 1.941 | 19.177 |
| 1.942 | 19.086 |
| 1.943 | 18.995 |
| 1.944 | 18.935 |
| 1.945 | 18.856 |
| 1.946 | 18.781 |
| 1.947 | 18.72 |
| 1.948 | 18.648 |
| 1.949 | 18.575 |
| 1.95 | 18.507 |
| 1.951 | 18.434 |
| 1.952 | 18.39 |
| 1.953 | 18.295 |
| 1.954 | 18.234 |
| 1.955 | 18.199 |
| 1.956 | 18.146 |
| 1.957 | 18.068 |
| 1.958 | 18.004 |
| 1.959 | 17.95 |
| 1.96 | 17.907 |
| 1.961 | 17.868 |
| 1.962 | 17.795 |
| 1.963 | 17.748 |
| 1.964 | 17.719 |
| 1.965 | 17.661 |
| 1.966 | 17.613 |
| 1.967 | 17.589 |
| 1.968 | 17.544 |
| 1.969 | 17.485 |
| 1.97 | 17.436 |
| 1.971 | 17.385 |
| 1.972 | 17.355 |
| 1.973 | 17.357 |
| 1.974 | 17.306 |
| 1.975 | 17.275 |
| 1.976 | 17.234 |
| 1.977 | 17.201 |
| 1.978 | 17.17 |
| 1.979 | 17.137 |
| 1.98 | 17.093 |
| 1.981 | 17.054 |
| 1.982 | 17.037 |
| 1.983 | 17.013 |
| 1.984 | 16.99 |
| 1.985 | 16.956 |
| 1.986 | 16.943 |
| 1.987 | 16.937 |
| 1.988 | 16.91 |
| 1.989 | 16.881 |
| 1.99 | 16.815 |
| 1.991 | 16.808 |
| 1.992 | 16.796 |
| 1.993 | 16.76 |
| 1.994 | 16.742 |
| 1.995 | 16.74 |
| 1.996 | 16.699 |
| 1.997 | 16.639 |
| 1.998 | 16.654 |
| 1.999 | 16.67 |
| 2.0 | 16.649 |
| 2.00994 | 17.867 |
| 2.0201 | 17.795 |
| 2.02997 | 17.784 |
| 2.03984 | 18.258 |
| 2.04998 | 18.58 |
| 2.05984 | 18.788 |
| 2.06999 | 19.218 |
| 2.07984 | 19.895 |
| 2.08997 | 20.424 |
| 2.09982 | 21.156 |
| 2.10995 | 22.065 |
| 2.12007 | 23.032 |
| 2.12991 | 23.992 |
| 2.14003 | 25.507 |
| 2.14986 | 26.628 |
| 2.15997 | 28.177 |
| 2.1698 | 29.763 |
| 2.1799 | 31.729 |
| 2.19 | 33.899 |
| 2.19982 | 36.217 |
| 2.20991 | 38.976 |
| 2.22 | 41.481 |
| 2.22981 | 44.524 |
| 2.23989 | 47.902 |
| 2.24997 | 51.817 |
| 2.25977 | 55.536 |
| 2.26984 | 59.665 |
| 2.27991 | 63.945 |
| 2.28998 | 68.134 |
| 2.29976 | 72.523 |
| 2.30982 | 76.885 |
| 2.31987 | 80.676 |
| 2.32992 | 84.003 |
| 2.33969 | 86.797 |
| 2.34973 | 89.128 |
| 2.35977 | 90.5 |
| 2.36981 | 91.468 |
| 2.37984 | 91.176 |
| 2.38987 | 90.702 |
| 2.39989 | 89.203 |
| 2.40964 | 87.099 |
| 2.41965 | 84.534 |
| 2.42967 | 81.823 |
| 2.43968 | 78.662 |
| 2.44968 | 75.769 |
| 2.45968 | 72.518 |
| 2.46968 | 69.316 |
| 2.47968 | 66.574 |
| 2.48967 | 63.573 |
| 2.49965 | 61.059 |
| 2.50964 | 58.502 |
| 2.51961 | 56.033 |
| 2.52959 | 54.004 |
| 2.53984 | 51.89 |
| 2.5498 | 50.175 |
| 2.55977 | 48.274 |
| 2.56972 | 46.906 |
| 2.57968 | 45.211 |
| 2.58963 | 43.94 |
| 2.59957 | 42.636 |
| 2.60979 | 41.714 |
| 2.61973 | 40.526 |
| 2.62966 | 39.544 |
| 2.63959 | 38.9 |
| 2.64952 | 38.449 |
| 2.65971 | 37.73 |
| 2.66963 | 36.744 |
| 2.67954 | 36.407 |
| 2.68973 | 36.152 |
| 2.69963 | 35.708 |
| 2.70953 | 35.527 |
| 2.7197 | 34.924 |
| 2.72959 | 34.932 |
| 2.73948 | 34.637 |
| 2.74963 | 34.38 |
| 2.75951 | 34.092 |
| 2.76966 | 34.321 |
| 2.77953 | 34.376 |
| 2.78967 | 34.662 |
| 2.79953 | 35.133 |
| 2.80966 | 34.888 |
| 2.81951 | 35.255 |
| 2.82963 | 35.304 |
| 2.83947 | 36.077 |
| 2.84958 | 36.214 |
| 2.85941 | 36.523 |
| 2.86951 | 36.809 |
| 2.87961 | 37.977 |
| 2.88943 | 38.084 |
| 2.89952 | 38.785 |
| 2.9096 | 39.423 |
| 2.91941 | 40.261 |
| 2.92948 | 40.661 |
| 2.93955 | 41.684 |
| 2.94934 | 42.489 |
| 2.9594 | 43.222 |
| 2.96945 | 44.357 |
| 2.9795 | 45.075 |
| 2.98954 | 46.273 |
| 2.99958 | 47.719 |
| 3.00934 | 48.543 |
| 3.01937 | 49.916 |
| 3.02939 | 50.975 |
| 3.03941 | 52.409 |
| 3.04942 | 53.927 |
| 3.05943 | 55.129 |
| 3.06943 | 56.54 |
| 3.07943 | 58.144 |
| 3.08942 | 59.722 |
| 3.09941 | 61.518 |
| 3.1094 | 63.138 |
| 3.11937 | 64.869 |
| 3.12934 | 66.866 |
| 3.13931 | 68.455 |
| 3.14927 | 70.449 |
| 3.15923 | 71.964 |
| 3.16945 | 74.359 |
| 3.1794 | 75.934 |
| 3.18933 | 78.34 |
| 3.19927 | 79.861 |
| 3.2092 | 81.622 |
| 3.21939 | 83.79 |
| 3.22931 | 85.195 |
| 3.23922 | 87.356 |
| 3.2494 | 88.522 |
| 3.2593 | 90.541 |
| 3.2692 | 91.985 |
| 3.27936 | 93.236 |
| 3.28925 | 94.746 |
| 3.29939 | 96.006 |
| 3.30927 | 97.707 |
| 3.31914 | 97.692 |
| 3.32927 | 98.596 |
| 3.33912 | 99.035 |
| 3.34924 | 99.749 |
| 3.35936 | 99.758 |
| 3.3692 | 99.942 |
| 3.3793 | 99.675 |
| 3.38913 | 99.758 |
| 3.39922 | 99.741 |
| 3.4093 | 98.738 |
| 3.41911 | 98.377 |
| 3.42918 | 97.778 |
| 3.43925 | 96.631 |
| 3.44931 | 95.527 |
| 3.4591 | 94.67 |
| 3.46915 | 93.419 |
| 3.47919 | 92.092 |
| 3.48922 | 90.254 |
| 3.49925 | 89.46 |
| 3.50927 | 88.112 |
| 3.51903 | 86.235 |
| 3.52904 | 85.241 |
| 3.53904 | 83.895 |
| 3.54904 | 82.276 |
| 3.55903 | 81.141 |
| 3.56902 | 79.51 |
| 3.579 | 78.667 |
| 3.58923 | 76.664 |
| 3.5992 | 75.123 |
| 3.60916 | 73.842 |
| 3.61911 | 72.082 |
| 3.62906 | 71.431 |
| 3.639 | 70.031 |
| 3.6492 | 68.741 |
| 3.65913 | 67.137 |
| 3.66905 | 65.636 |
| 3.67896 | 64.398 |
| 3.68913 | 64.043 |
| 3.69904 | 62.596 |
| 3.70893 | 61.081 |
| 3.71908 | 60.943 |
| 3.72897 | 59.324 |
| 3.7391 | 57.361 |
| 3.74897 | 57.184 |
| 3.75909 | 55.797 |
| 3.76895 | 55.079 |
| 3.77906 | 54.558 |
| 3.7889 | 53.997 |
| 3.79899 | 52.806 |
| 3.80908 | 52.386 |
| 3.8189 | 51.235 |
| 3.82897 | 51.033 |
| 3.83904 | 49.727 |
| 3.8491 | 48.871 |
| 3.8589 | 48.455 |
| 3.86894 | 47.816 |
| 3.87898 | 46.757 |
| 3.88901 | 46.61 |
| 3.89903 | 46.154 |
| 3.90905 | 45.531 |
| 3.91906 | 44.152 |
| 3.9288 | 44.281 |
| 3.9388 | 43.526 |
| 3.94904 | 43.519 |
| 3.95902 | 42.873 |
| 3.96899 | 42.422 |
| 3.97896 | 42.201 |
| 3.98892 | 41.319 |
| 3.99887 | 41.255 |
| 4.00881 | 41.105 |
| 4.019 | 40.51 |
| 4.02893 | 40.021 |
| 4.03885 | 39.594 |
| 4.04876 | 39.654 |
| 4.05892 | 39.867 |
| 4.06882 | 39.271 |
| 4.07896 | 38.744 |
| 4.08885 | 38.053 |
| 4.09872 | 38.089 |
| 4.10884 | 37.25 |
| 4.1187 | 37.384 |
| 4.12881 | 36.938 |
| 4.1389 | 37.422 |
| 4.14874 | 36.929 |
| 4.15882 | 36.281 |
| 4.16889 | 36.251 |
| 4.1787 | 36.464 |
| 4.18876 | 36.542 |
| 4.19881 | 36.33 |
| 4.20885 | 35.997 |
| 4.21888 | 35.879 |
| 4.22865 | 37.715 |
| 4.23867 | 34.273 |
| 4.24867 | 34.54 |
| 4.25867 | 34.156 |
| 4.26866 | 38.196 |
| 4.27865 | 33.755 |
| 4.28862 | 34.275 |
| 4.29884 | 34.649 |
| 4.30879 | 35.092 |
| 4.31874 | 34.463 |
| 4.32868 | 35.473 |
| 4.33861 | 35.112 |
| 4.34878 | 34.936 |
| 4.3587 | 34.458 |
| 4.3686 | 34.906 |
| 4.37875 | 35.149 |
| 4.38864 | 34.159 |
| 4.39876 | 34.667 |
| 4.40864 | 34.775 |
| 4.41875 | 34.719 |
| 4.4286 | 34.885 |
| 4.43869 | 34.757 |
| 4.44853 | 34.591 |
| 4.4586 | 34.617 |
| 4.46866 | 34.06 |
| 4.47872 | 34.069 |
| 4.48852 | 34.45 |
| 4.49856 | 34.346 |
| 4.50859 | 34.644 |
| 4.5186 | 34.662 |
| 4.52861 | 34.966 |
| 4.53861 | 34.491 |
| 4.5486 | 34.483 |
| 4.55858 | 34.669 |
| 4.56856 | 34.797 |
| 4.57852 | 34.624 |
| 4.58847 | 34.624 |
| 4.59866 | 34.375 |
| 4.60859 | 34.909 |
| 4.61852 | 35.12 |
| 4.62843 | 35.424 |
| 4.63858 | 35.238 |
| 4.64848 | 35.343 |
| 4.65861 | 35.298 |
| 4.66848 | 35.403 |
| 4.67859 | 36.016 |
| 4.68845 | 36.042 |
| 4.69854 | 35.923 |
| 4.70861 | 36.257 |
| 4.71844 | 35.757 |
| 4.7285 | 36.754 |
| 4.73855 | 36.92 |
| 4.74859 | 36.647 |
| 4.75837 | 36.895 |
| 4.76839 | 36.954 |
| 4.7784 | 36.949 |
| 4.78839 | 37.431 |
| 4.79838 | 37.391 |
| 4.80836 | 37.489 |
| 4.81832 | 37.675 |
| 4.82852 | 37.269 |
| 4.83846 | 37.752 |
| 4.8484 | 38.005 |
| 4.85832 | 38.415 |
| 4.86847 | 38.645 |
| 4.87837 | 38.849 |
| 4.8885 | 38.41 |
| 4.89838 | 38.634 |
| 4.90849 | 38.951 |
| 4.91835 | 39.322 |
| 4.92843 | 39.753 |
| 4.93827 | 39.167 |
| 4.94833 | 39.175 |
| 4.95838 | 39.6 |
| 4.96842 | 40.499 |
| 4.97845 | 40.111 |
| 4.98824 | 40.271 |
| 4.99824 | 40.426 |
| 5.00853 | 41.285 |
| 5.01835 | 40.942 |
| 5.02817 | 40.714 |
| 5.03799 | 41.441 |
| 5.04856 | 41.924 |
| 5.05837 | 41.751 |
| 5.06819 | 41.77 |
| 5.078 | 42.608 |
| 5.08857 | 42.612 |
| 5.09837 | 42.592 |
| 5.10818 | 43.253 |
| 5.11799 | 43.396 |
| 5.12856 | 43.244 |
| 5.13836 | 43.66 |
| 5.14817 | 43.662 |
| 5.15797 | 43.939 |
| 5.16853 | 44.235 |
| 5.17833 | 44.655 |
| 5.18813 | 45.579 |
| 5.19793 | 44.61 |
| 5.20848 | 45.31 |
| 5.21828 | 45.458 |
| 5.22808 | 45.811 |
| 5.23787 | 46.257 |
| 5.24842 | 46.28 |
| 5.25821 | 46.548 |
| 5.268 | 47.157 |
| 5.27855 | 47.44 |
| 5.28834 | 48.331 |
| 5.29813 | 48.151 |
| 5.30792 | 48.377 |
| 5.31846 | 48.753 |
| 5.32824 | 48.912 |
| 5.33803 | 48.809 |
| 5.34781 | 49.064 |
| 5.35834 | 49.692 |
| 5.36812 | 50.413 |
| 5.3779 | 50.205 |
| 5.38843 | 50.429 |
| 5.39821 | 50.105 |
| 5.40799 | 50.827 |
| 5.41776 | 51.454 |
| 5.42829 | 51.358 |
| 5.43806 | 51.119 |
| 5.44783 | 52.324 |
| 5.45836 | 52.46 |
| 5.46812 | 52.624 |
| 5.47789 | 52.827 |
| 5.48841 | 53.42 |
| 5.49818 | 53.538 |
| 5.50794 | 53.575 |
| 5.51771 | 53.858 |
| 5.52822 | 54.476 |
| 5.53798 | 55.007 |
| 5.54774 | 55.108 |
| 5.55825 | 55.452 |
| 5.56801 | 55.839 |
| 5.57777 | 56.672 |
| 5.58827 | 56.732 |
| 5.59803 | 57.147 |
| 5.60778 | 56.184 |
| 5.61828 | 57.026 |
| 5.62803 | 56.98 |
| 5.63778 | 57.764 |
| 5.64828 | 58.401 |
| 5.65803 | 58.708 |
| 5.66777 | 59.031 |
| 5.67827 | 59.106 |
| 5.68801 | 59.929 |
| 5.69775 | 60.051 |
| 5.70824 | 60.182 |
| 5.71798 | 61.148 |
| 5.72772 | 61.768 |
| 5.73821 | 61.544 |
| 5.74795 | 62.289 |
| 5.75768 | 62.492 |
| 5.76816 | 62.749 |
| 5.7779 | 63.459 |
| 5.78763 | 63.393 |
| 5.79811 | 64.289 |
| 5.80784 | 63.968 |
| 5.81757 | 64.386 |
| 5.82804 | 63.557 |
| 5.83777 | 65.212 |
| 5.84749 | 65.872 |
| 5.85796 | 64.653 |
| 5.86768 | 65.819 |
| 5.87815 | 64.897 |
| 5.88787 | 67.783 |
| 5.89759 | 66.983 |
| 5.90805 | 67.566 |
| 5.91777 | 67.626 |
| 5.92748 | 68.599 |
| 5.93794 | 67.171 |
| 5.94765 | 68.111 |
| 5.95811 | 69.655 |
| 5.96782 | 68.102 |
| 5.97753 | 69.163 |
| 5.98798 | 69.683 |
| 5.99769 | 70.143 |
| 6.00814 | 70.941 |
| 6.01784 | 70.635 |
| 6.02754 | 71.519 |
| 6.03799 | 70.261 |
| 6.04769 | 71.438 |
| 6.05738 | 71.661 |
| 6.06783 | 71.014 |
| 6.07752 | 71.889 |
| 6.08796 | 72.486 |
| 6.09765 | 71.711 |
| 6.10809 | 72.776 |
| 6.11778 | 73.169 |
| 6.12747 | 73.859 |
| 6.1379 | 73.684 |
| 6.14759 | 74.734 |
| 6.15802 | 74.692 |
| 6.1677 | 74.77 |
| 6.17738 | 74.535 |
| 6.18781 | 75.04 |
| 6.19749 | 75.19 |
| 6.20791 | 76.831 |
| 6.21759 | 76.535 |
| 6.22801 | 76.674 |
| 6.23768 | 77.18 |
| 6.24735 | 77.776 |
| 6.25777 | 77.715 |
| 6.26744 | 77.922 |
| 6.27785 | 78.513 |
| 6.28752 | 78.698 |
| 6.29793 | 78.833 |
| 6.30759 | 79.581 |
| 6.31726 | 80.016 |
| 6.32766 | 79.492 |
| 6.33732 | 80.931 |
| 6.34773 | 80.169 |
| 6.35738 | 80.377 |
| 6.36778 | 81.027 |
| 6.37744 | 81.303 |
| 6.38784 | 81.312 |
| 6.39749 | 81.817 |
| 6.40788 | 81.26 |
| 6.41753 | 81.607 |
| 6.42718 | 81.491 |
| 6.43757 | 83.562 |
| 6.44722 | 82.792 |
| 6.4576 | 83.236 |
| 6.46725 | 82.644 |
| 6.47763 | 84.014 |
| 6.48727 | 83.651 |
| 6.49765 | 85.554 |
| 6.50729 | 84.522 |
| 6.51767 | 84.651 |
| 6.5273 | 86.426 |
| 6.53767 | 85.663 |
| 6.54731 | 84.793 |
| 6.55768 | 84.367 |
| 6.56731 | 85.332 |
| 6.57768 | 86.859 |
| 6.5873 | 86.795 |
| 6.59767 | 87.021 |
| 6.60729 | 87.387 |
| 6.61765 | 87.046 |
| 6.62727 | 86.152 |
| 6.63763 | 87.113 |
| 6.64725 | 88.831 |
| 6.65761 | 89.088 |
| 6.66722 | 88.178 |
| 6.67758 | 87.596 |
| 6.68719 | 88.704 |
| 6.69754 | 89.879 |
| 6.70715 | 88.985 |
| 6.71749 | 89.514 |
| 6.7271 | 89.308 |
| 6.73744 | 89.285 |
| 6.74705 | 89.533 |
| 6.75739 | 90.316 |
| 6.76699 | 90.101 |
| 6.77733 | 90.09 |
| 6.78766 | 90.217 |
| 6.79726 | 91.492 |
| 6.80759 | 90.87 |
| 6.81719 | 91.863 |
| 6.82752 | 91.561 |
| 6.83711 | 92.041 |
| 6.84743 | 91.693 |
| 6.85702 | 90.754 |
| 6.86734 | 90.943 |
| 6.87693 | 92.151 |
| 6.88725 | 92.106 |
| 6.89757 | 91.609 |
| 6.90715 | 91.084 |
| 6.91746 | 92.453 |
| 6.92704 | 93.221 |
| 6.93735 | 91.601 |
| 6.94693 | 93.038 |
| 6.95723 | 93.73 |
| 6.96754 | 93.534 |
| 6.97711 | 92.431 |
| 6.98742 | 93.397 |
| 6.99698 | 92.942 |
| 7.00728 | 92.523 |
| 7.01685 | 93.626 |
| 7.02715 | 94.062 |
| 7.03744 | 93.114 |
| 7.047 | 93.909 |
| 7.05729 | 94.119 |
| 7.06685 | 93.994 |
| 7.07714 | 93.872 |
| 7.08743 | 94.521 |
| 7.09698 | 93.846 |
| 7.10726 | 95.266 |
| 7.11681 | 94.942 |
| 7.12709 | 95.725 |
| 7.13737 | 94.766 |
| 7.14692 | 94.265 |
| 7.15719 | 94.738 |
| 7.16747 | 96.087 |
| 7.17701 | 95.945 |
| 7.18728 | 95.728 |
| 7.19681 | 96.082 |
| 7.20708 | 95.502 |
| 7.21735 | 96.101 |
| 7.22688 | 95.447 |
| 7.23714 | 96.167 |
| 7.2474 | 96.486 |
| 7.25693 | 96.159 |
| 7.26719 | 96.284 |
| 7.27671 | 96.169 |
| 7.28697 | 97.423 |
| 7.29722 | 96.292 |
| 7.30674 | 95.907 |
| 7.31699 | 95.854 |
| 7.32723 | 97.208 |
| 7.33675 | 96.667 |
| 7.34699 | 96.365 |
| 7.35724 | 96.818 |
| 7.36675 | 95.931 |
| 7.37699 | 97.631 |
| 7.38722 | 97.007 |
| 7.39673 | 96.719 |
| 7.40696 | 96.272 |
| 7.41719 | 97.049 |
| 7.42669 | 96.767 |
| 7.43692 | 97.593 |
| 7.44715 | 96.907 |
| 7.45664 | 97.156 |
| 7.46687 | 97.788 |
| 7.47709 | 96.705 |
| 7.48731 | 97.962 |
| 7.4968 | 96.826 |
| 7.50701 | 97.545 |
| 7.51723 | 97.636 |
| 7.52671 | 97.474 |
| 7.53692 | 97.235 |
| 7.54713 | 97.538 |
| 7.55661 | 97.759 |
| 7.56682 | 97.732 |
| 7.57702 | 97.514 |
| 7.58723 | 97.262 |
| 7.5967 | 98.056 |
| 7.6069 | 97.369 |
| 7.61709 | 97.592 |
| 7.62656 | 98.525 |
| 7.63675 | 97.877 |
| 7.64695 | 97.97 |
| 7.65714 | 98.234 |
| 7.6666 | 98.079 |
| 7.67678 | 98.364 |
| 7.68697 | 97.543 |
| 7.69715 | 98.417 |
| 7.7066 | 98.276 |
| 7.71678 | 97.527 |
| 7.72696 | 97.835 |
| 7.73714 | 97.469 |
| 7.74658 | 99.153 |
| 7.75676 | 97.873 |
| 7.76692 | 98.131 |
| 7.77709 | 98.393 |
| 7.78653 | 98.002 |
| 7.7967 | 97.799 |
| 7.80686 | 98.75 |
| 7.81702 | 98.577 |
| 7.82646 | 98.451 |
| 7.83661 | 98.708 |
| 7.84677 | 98.29 |
| 7.85692 | 98.493 |
| 7.86707 | 97.905 |
| 7.8765 | 98.602 |
| 7.88665 | 98.17 |
| 7.89679 | 98.515 |
| 7.90694 | 99.022 |
| 7.91636 | 98.908 |
| 7.9265 | 99.141 |
| 7.93663 | 97.983 |
| 7.94677 | 98.791 |
| 7.95691 | 99.218 |
| 7.96704 | 98.507 |
| 7.97645 | 98.765 |
| 7.98658 | 98.728 |
| 7.99671 | 98.245 |
| 8.00683 | 98.82 |
| 8.01695 | 98.669 |
| 8.02635 | 98.815 |
| 8.03647 | 98.528 |
| 8.04659 | 97.973 |
| 8.05671 | 98.73 |
| 8.06682 | 99.495 |
| 8.07693 | 98.581 |
| 8.08632 | 98.642 |
| 8.09643 | 99.118 |
| 8.10654 | 98.727 |
| 8.11664 | 98.964 |
| 8.12674 | 98.742 |
| 8.13685 | 98.882 |
| 8.14695 | 98.074 |
| 8.15632 | 98.354 |
| 8.16642 | 98.522 |
| 8.17651 | 98.42 |
| 8.1866 | 98.367 |
| 8.19669 | 99.184 |
| 8.20678 | 99.161 |
| 8.21686 | 98.49 |
| 8.22623 | 97.924 |
| 8.23631 | 98.2 |
| 8.24639 | 98.489 |
| 8.25646 | 98.75 |
| 8.26654 | 98.419 |
| 8.27661 | 98.007 |
| 8.28669 | 98.429 |
| 8.29675 | 98.61 |
| 8.30682 | 98.422 |
| 8.31617 | 97.983 |
| 8.32623 | 97.504 |
| 8.3363 | 98.526 |
| 8.34636 | 98.259 |
| 8.35641 | 98.924 |
| 8.36647 | 99.307 |
| 8.37652 | 98.853 |
| 8.38658 | 98.731 |
| 8.39663 | 99.003 |
| 8.40667 | 97.822 |
| 8.41672 | 98.16 |
| 8.42676 | 98.97 |
| 8.43609 | 98.024 |
| 8.44613 | 99.594 |
| 8.45617 | 99.205 |
| 8.4662 | 98.096 |
| 8.47624 | 98.707 |
| 8.48627 | 98.936 |
| 8.4963 | 99.568 |
| 8.50633 | 98.679 |
| 8.51635 | 98.029 |
| 8.52638 | 98.346 |
| 8.5364 | 98.407 |
| 8.54642 | 98.487 |
| 8.55644 | 99.314 |
| 8.56645 | 97.823 |
| 8.57647 | 98.682 |
| 8.58648 | 98.702 |
| 8.59649 | 98.108 |
| 8.60649 | 98.148 |
| 8.6165 | 98.267 |
| 8.6265 | 98.697 |
| 8.6365 | 98.495 |
| 8.6465 | 99.478 |
| 8.6565 | 98.292 |
| 8.66649 | 98.359 |
| 8.67649 | 99.238 |
| 8.68648 | 98.454 |
| 8.69647 | 98.804 |
| 8.70646 | 98.078 |
| 8.71644 | 98.075 |
| 8.72642 | 99.299 |
| 8.7364 | 99.168 |
| 8.74638 | 98.145 |
| 8.75636 | 98.74 |
| 8.76633 | 97.661 |
| 8.77631 | 98.82 |
| 8.78627 | 99.477 |
| 8.79624 | 98.76 |
| 8.80621 | 98.517 |
| 8.81617 | 98.964 |
| 8.82613 | 99 |
| 8.83609 | 98.695 |
| 8.84605 | 98.496 |
| 8.85601 | 98.464 |
| 8.86596 | 98.925 |
| 8.87591 | 98.609 |
| 8.88586 | 99.401 |
| 8.89652 | 98.586 |
| 8.90646 | 98.438 |
| 8.9164 | 99.076 |
| 8.92634 | 99.5 |
| 8.93628 | 98.542 |
| 8.94622 | 98.301 |
| 8.95615 | 98.407 |
| 8.96609 | 98.168 |
| 8.97602 | 99.211 |
| 8.98594 | 98.231 |
| 8.99587 | 98.727 |
| 9.00579 | 98.536 |
| 9.01642 | 98.42 |
| 9.02634 | 98.789 |
| 9.03626 | 98.019 |
| 9.04617 | 98.598 |
| 9.05608 | 98.234 |
| 9.06599 | 98.005 |
| 9.0759 | 98.603 |
| 9.08581 | 98.222 |
| 9.09571 | 98.752 |
| 9.10632 | 98.611 |
| 9.11622 | 98.637 |
| 9.12612 | 98.77 |
| 9.13601 | 98.502 |
| 9.1459 | 98.886 |
| 9.15579 | 97.935 |
| 9.16568 | 98.272 |
| 9.17628 | 98.259 |
| 9.18616 | 97.797 |
| 9.19604 | 98.768 |
| 9.20592 | 98.32 |
| 9.2158 | 98.954 |
| 9.22567 | 98.295 |
| 9.23625 | 98.961 |
| 9.24612 | 98.747 |
| 9.25599 | 98.652 |
| 9.26585 | 99.068 |
| 9.27572 | 98.345 |
| 9.28628 | 98.17 |
| 9.29614 | 98.14 |
| 9.306 | 97.891 |
| 9.31585 | 99.141 |
| 9.32571 | 98.615 |
| 9.33626 | 98.813 |
| 9.34611 | 98.433 |
| 9.35595 | 98.714 |
| 9.3658 | 98.518 |
| 9.37564 | 99.304 |
| 9.38618 | 98.246 |
| 9.39602 | 98.13 |
| 9.40585 | 98.223 |
| 9.41568 | 98.827 |
| 9.42621 | 98.667 |
| 9.43604 | 98.898 |
| 9.44587 | 98.147 |
| 9.45569 | 98.825 |
| 9.46551 | 98.317 |
| 9.47603 | 99.223 |
| 9.48585 | 98.278 |
| 9.49566 | 99.306 |
| 9.50617 | 98.55 |
| 9.51598 | 99.271 |
| 9.52579 | 98.645 |
| 9.53559 | 98.071 |
| 9.54609 | 98.611 |
| 9.55589 | 97.76 |
| 9.56569 | 98.273 |
| 9.57549 | 98.051 |
| 9.58598 | 98.631 |
| 9.59577 | 98.456 |
| 9.60556 | 98.712 |
| 9.61604 | 98.192 |
| 9.62583 | 98.375 |
| 9.63561 | 98.391 |
| 9.64608 | 98.313 |
| 9.65586 | 98.185 |
| 9.66563 | 98.663 |
| 9.6754 | 99.167 |
| 9.68587 | 98.187 |
| 9.69564 | 98.514 |
| 9.7054 | 98.234 |
| 9.71586 | 98.338 |
| 9.72562 | 99.014 |
| 9.73538 | 97.966 |
| 9.74583 | 98.765 |
| 9.75559 | 98.432 |
| 9.76603 | 98.652 |
| 9.77578 | 98.515 |
| 9.78552 | 98.196 |
| 9.79596 | 98.155 |
| 9.8057 | 98.3 |
| 9.81544 | 99.532 |
| 9.82587 | 98.954 |
| 9.83561 | 99.251 |
| 9.84534 | 98.729 |
| 9.85576 | 98.74 |
| 9.86549 | 99.262 |
| 9.87591 | 99.533 |
| 9.88563 | 98.342 |
| 9.89535 | 98.95 |
| 9.90576 | 99.043 |
| 9.91547 | 99.179 |
| 9.92588 | 98.95 |
| 9.93558 | 98.222 |
| 9.94529 | 98.734 |
| 9.95569 | 98.742 |
| 9.96539 | 99.127 |
| 9.97578 | 98.862 |
| 9.98548 | 99.224 |
| 9.99587 | 99.05 |
| 10.00556 | 99.339 |
| 10.01525 | 98.948 |
| 10.02563 | 98.538 |
| 10.03531 | 98.454 |
| 10.04569 | 98.875 |
| 10.05537 | 98.74 |
| 10.06573 | 99.456 |
| 10.07541 | 99.395 |
| 10.08577 | 98.347 |
| 10.09544 | 99.077 |
| 10.1058 | 98.634 |
| 10.11546 | 99.575 |
| 10.12582 | 99.024 |
| 10.13548 | 98.437 |
| 10.14513 | 99.083 |
| 10.15548 | 99.538 |
| 10.16513 | 99.34 |
| 10.17547 | 99.469 |
| 10.18512 | 99.197 |
| 10.19545 | 98.829 |
| 10.20578 | 98.54 |
| 10.21542 | 99.522 |
| 10.22575 | 98.934 |
| 10.23538 | 98.994 |
| 10.2457 | 99.341 |
| 10.25533 | 99.06 |
| 10.26564 | 98.969 |
| 10.27527 | 97.895 |
| 10.28558 | 98.514 |
| 10.2952 | 99.172 |
| 10.3055 | 99.163 |
| 10.31511 | 99.293 |
| 10.32541 | 98.653 |
| 10.33571 | 98.642 |
| 10.34531 | 99.316 |
| 10.3556 | 99.138 |
| 10.36521 | 98.932 |
| 10.37549 | 99.472 |
| 10.38509 | 99.134 |
| 10.39536 | 98.496 |
| 10.40564 | 99.336 |
| 10.41523 | 98.83 |
| 10.4255 | 98.804 |
| 10.43508 | 98.771 |
| 10.44535 | 98.799 |
| 10.45561 | 98.969 |
| 10.46519 | 98.027 |
| 10.47544 | 98.47 |
| 10.48501 | 99.385 |
| 10.49526 | 99.183 |
| 10.50551 | 98.217 |
| 10.51507 | 98.65 |
| 10.52532 | 99.146 |
| 10.53556 | 99.198 |
| 10.54511 | 99.168 |
| 10.55534 | 98.624 |
| 10.56558 | 98.987 |
| 10.57512 | 99.633 |
| 10.58535 | 98.634 |
| 10.59489 | 98.573 |
| 10.60511 | 99.574 |
| 10.61533 | 99.398 |
| 10.62554 | 99.034 |
| 10.63507 | 99.193 |
| 10.64528 | 99.202 |
| 10.65548 | 98.886 |
| 10.66501 | 98.404 |
| 10.67521 | 99.032 |
| 10.6854 | 98.967 |
| 10.69492 | 97.899 |
| 10.70511 | 98.761 |
| 10.7153 | 98.931 |
| 10.72548 | 98.655 |
| 10.73499 | 98.531 |
| 10.74517 | 98.815 |
| 10.75534 | 99.097 |
| 10.76484 | 98.717 |
| 10.77501 | 99.248 |
| 10.78518 | 98.975 |
| 10.79534 | 98.736 |
| 10.80483 | 99.395 |
| 10.81499 | 98.916 |
| 10.82515 | 99.27 |
| 10.8353 | 99.488 |
| 10.84477 | 98.963 |
| 10.85492 | 98.79 |
| 10.86507 | 99.676 |
| 10.87521 | 99.413 |
| 10.88535 | 99.033 |
| 10.89481 | 99.345 |
| 10.90494 | 98.792 |
| 10.91507 | 98.994 |
| 10.9252 | 99.131 |
| 10.93532 | 99.756 |
| 10.94477 | 98.716 |
| 10.95489 | 98.628 |
| 10.965 | 98.452 |
| 10.97511 | 99.068 |
| 10.98522 | 98.894 |
| 10.99533 | 98.97 |
| 11.00476 | 98.965 |
| 11.01486 | 99.242 |
| 11.02496 | 98.345 |
| 11.03505 | 99.747 |
| 11.04514 | 98.599 |
| 11.05523 | 99.291 |
| 11.06465 | 99.337 |
| 11.07473 | 98.993 |
| 11.08481 | 98.966 |
| 11.09488 | 99.102 |
| 11.10496 | 98.638 |
| 11.11503 | 99.85 |
| 11.12509 | 98.583 |
| 11.13516 | 99.076 |
| 11.14522 | 98.763 |
| 11.15461 | 99.206 |
| 11.16466 | 98.857 |
| 11.17472 | 99.281 |
| 11.18476 | 99.401 |
| 11.19481 | 99.299 |
| 11.20485 | 98.47 |
| 11.21489 | 98.509 |
| 11.22493 | 98.118 |
| 11.23496 | 99.567 |
| 11.245 | 98.344 |
| 11.25502 | 98.608 |
| 11.26505 | 98.858 |
| 11.27507 | 98.868 |
| 11.28509 | 99.245 |
| 11.2951 | 98.244 |
| 11.30511 | 98.841 |
| 11.31512 | 98.588 |
| 11.32513 | 98.103 |
| 11.33513 | 99.155 |
| 11.34513 | 98.481 |
| 11.35513 | 98.774 |
| 11.36512 | 98.687 |
| 11.37511 | 97.773 |
| 11.3851 | 99.303 |
| 11.39509 | 98.589 |
| 11.40507 | 98.401 |
| 11.41504 | 98.973 |
| 11.42502 | 97.766 |
| 11.43499 | 98.694 |
| 11.44496 | 99.065 |
| 11.45492 | 98.859 |
| 11.46489 | 98.771 |
| 11.47485 | 99.53 |
| 11.4848 | 98.682 |
| 11.49475 | 98.305 |
| 11.5047 | 99.162 |
| 11.51465 | 97.785 |
| 11.52459 | 98.724 |
| 11.53453 | 99.038 |
| 11.54447 | 99.189 |
| 11.55441 | 99.719 |
| 11.565 | 97.979 |
| 11.57493 | 98.537 |
| 11.58485 | 98.709 |
| 11.59477 | 98.938 |
| 11.60469 | 97.885 |
| 11.6146 | 98.094 |
| 11.62451 | 98.974 |
| 11.63442 | 98.82 |
| 11.64433 | 98.309 |
| 11.65489 | 98.465 |
| 11.66479 | 98.649 |
| 11.67468 | 99.506 |
| 11.68458 | 99.119 |
| 11.69446 | 97.932 |
| 11.70435 | 99.205 |
| 11.71489 | 97.614 |
| 11.72477 | 97.993 |
| 11.73465 | 98.49 |
| 11.74452 | 99.423 |
| 11.75439 | 97.806 |
| 11.76425 | 98.056 |
| 11.77478 | 97.884 |
| 11.78463 | 99.159 |
| 11.79449 | 98.77 |
| 11.80434 | 97.888 |
| 11.81485 | 97.362 |
| 11.8247 | 98.584 |
| 11.83454 | 98.229 |
| 11.84438 | 98.495 |
| 11.85422 | 98.479 |
| 11.8647 | 99.163 |
| 11.87453 | 98.458 |
| 11.88436 | 98.586 |
| 11.89418 | 98.536 |
| 11.90466 | 96.713 |
| 11.91448 | 97.885 |
| 11.92429 | 98.237 |
| 11.93475 | 97.837 |
| 11.94456 | 97.714 |
| 11.95436 | 98.974 |
| 11.96416 | 97.439 |
| 11.97461 | 97.973 |
| 11.98441 | 97.661 |
| 11.9942 | 97.762 |
| 12.00464 | 99.302 |
| 12.01442 | 97.858 |
| 12.0242 | 99.305 |
| 12.03463 | 97.792 |
| 12.0444 | 97.145 |
| 12.05417 | 97.061 |
| 12.06459 | 98.211 |
| 12.07435 | 97.625 |
| 12.08411 | 98.588 |
| 12.09452 | 97.994 |
| 12.10427 | 97.286 |
| 12.11467 | 97.553 |
| 12.12441 | 97.788 |
| 12.13416 | 97.404 |
| 12.14455 | 97.892 |
| 12.15428 | 98.566 |
| 12.16466 | 98.87 |
| 12.17439 | 99.09 |
| 12.18412 | 98.153 |
| 12.19449 | 97.351 |
| 12.20421 | 97.706 |
| 12.21457 | 97.67 |
| 12.22428 | 97.864 |
| 12.23464 | 96.852 |
| 12.24434 | 97.703 |
| 12.25404 | 97.859 |
| 12.26439 | 98.014 |
| 12.27408 | 97.13 |
| 12.28442 | 96.614 |
| 12.2941 | 97.317 |
| 12.30443 | 97.94 |
| 12.31411 | 97.931 |
| 12.32444 | 97.487 |
| 12.33411 | 97.895 |
| 12.34443 | 97.571 |
| 12.35409 | 97.138 |
| 12.3644 | 97.128 |
| 12.37406 | 95.972 |
| 12.38436 | 97.422 |
| 12.39401 | 98.192 |
| 12.4043 | 98.206 |
| 12.41395 | 98.191 |
| 12.42423 | 97.509 |
| 12.43451 | 97.525 |
| 12.44415 | 96.49 |
| 12.45442 | 98.156 |
| 12.46405 | 98.052 |
| 12.47432 | 97.689 |
| 12.48394 | 95.74 |
| 12.4942 | 96.64 |
| 12.50445 | 97.435 |
| 12.51406 | 96.28 |
| 12.52431 | 96.093 |
| 12.53391 | 97.11 |
| 12.54415 | 96.336 |
| 12.55438 | 96.248 |
| 12.56398 | 97.485 |
| 12.5742 | 96.793 |
| 12.58443 | 97.91 |
| 12.59401 | 97.119 |
| 12.60423 | 97.02 |
| 12.6138 | 97.679 |
| 12.62401 | 97.682 |
| 12.63421 | 95.745 |
| 12.64378 | 96.324 |
| 12.65397 | 95.925 |
| 12.66417 | 97.093 |
| 12.67436 | 96.717 |
| 12.6839 | 97.143 |
| 12.69409 | 98.046 |
| 12.70426 | 95.933 |
| 12.7138 | 96.821 |
| 12.72397 | 96.059 |
| 12.73414 | 97.319 |
| 12.7443 | 96.963 |
| 12.75382 | 96.728 |
| 12.76398 | 97.513 |
| 12.77413 | 95.881 |
| 12.78427 | 95.833 |
| 12.79378 | 95.696 |
| 12.80392 | 96.5 |
| 12.81405 | 94.935 |
| 12.82418 | 96.637 |
| 12.83368 | 95.739 |
| 12.8438 | 96.633 |
| 12.85392 | 96.075 |
| 12.86403 | 97.623 |
| 12.87415 | 96.009 |
| 12.88425 | 96.868 |
| 12.89372 | 95.197 |
| 12.90382 | 96.962 |
| 12.91392 | 97.347 |
| 12.92401 | 96.543 |
| 12.9341 | 96.745 |
| 12.94418 | 95.804 |
| 12.95363 | 94.707 |
| 12.9637 | 96.117 |
| 12.97377 | 95.302 |
| 12.98384 | 95.126 |
| 12.9939 | 96.068 |
| 13.00396 | 96.279 |
| 13.01402 | 97.018 |
| 13.02407 | 95.324 |
| 13.03411 | 96.877 |
| 13.04416 | 95.581 |
| 13.05357 | 95.392 |
| 13.0636 | 96.234 |
| 13.07363 | 94.788 |
| 13.08366 | 95.195 |
| 13.09368 | 96.426 |
| 13.1037 | 96.275 |
| 13.11371 | 95.884 |
| 13.12372 | 95.786 |
| 13.13373 | 96.446 |
| 13.14373 | 94.699 |
| 13.15373 | 96.472 |
| 13.16372 | 96.135 |
| 13.17371 | 95.094 |
| 13.1837 | 94.7 |
| 13.19368 | 95.258 |
| 13.20366 | 96.661 |
| 13.21363 | 95.629 |
| 13.2236 | 95.567 |
| 13.23357 | 94.91 |
| 13.24353 | 95.72 |
| 13.25348 | 95.377 |
| 13.26344 | 94.359 |
| 13.27401 | 95.404 |
| 13.28395 | 95.383 |
| 13.29389 | 95.54 |
| 13.30383 | 95.437 |
| 13.31376 | 94.403 |
| 13.32368 | 94.942 |
| 13.33361 | 94.962 |
| 13.34353 | 94.437 |
| 13.35344 | 94.874 |
| 13.36397 | 94.37 |
| 13.37388 | 95.546 |
| 13.38378 | 95.29 |
| 13.39368 | 96.29 |
| 13.40357 | 94.067 |
| 13.41346 | 95.693 |
| 13.42335 | 93.746 |
| 13.43385 | 94.254 |
| 13.44372 | 94.693 |
| 13.4536 | 95.271 |
| 13.46346 | 95.739 |
| 13.47333 | 94.087 |
| 13.4838 | 94.404 |
| 13.49366 | 95.062 |
| 13.50351 | 94.562 |
| 13.51336 | 94.008 |
| 13.52382 | 94.514 |
| 13.53366 | 93.778 |
| 13.54349 | 94.801 |
| 13.55332 | 94.461 |
| 13.56376 | 94.332 |
| 13.57358 | 94.103 |
| 13.5834 | 94.326 |
| 13.59382 | 93.329 |
| 13.60363 | 93.581 |
| 13.61344 | 92.86 |
| 13.62385 | 95.285 |
| 13.63364 | 94.538 |
| 13.64343 | 92.33 |
| 13.65322 | 93.426 |
| 13.66362 | 93.906 |
| 13.67339 | 94.553 |
| 13.68378 | 93.553 |
| 13.69355 | 94.809 |
| 13.70331 | 94.242 |
| 13.71368 | 93.792 |
| 13.72344 | 92.664 |
| 13.73319 | 94.232 |
| 13.74355 | 93.231 |
| 13.75329 | 93.265 |
| 13.76364 | 93.701 |
| 13.77337 | 93.147 |
| 13.78371 | 94.067 |
| 13.79343 | 93.28 |
| 13.80316 | 93.095 |
| 13.81348 | 93.51 |
| 13.82319 | 92.555 |
| 13.83351 | 93.74 |
| 13.84321 | 93.112 |
| 13.85351 | 93.449 |
| 13.86321 | 92.447 |
| 13.8735 | 92.091 |
| 13.88319 | 93.927 |
| 13.89348 | 93.813 |
| 13.90315 | 93.521 |
| 13.91343 | 94.181 |
| 13.9231 | 93.172 |
| 13.93336 | 93.041 |
| 13.94362 | 94.381 |
| 13.95328 | 92.749 |
| 13.96353 | 93.429 |
| 13.97318 | 92.184 |
| 13.98342 | 92.566 |
| 13.99305 | 93.611 |
| 14.00329 | 92.614 |
| 14.01352 | 93.176 |
| 14.02314 | 92.698 |
| 14.03336 | 93.616 |
| 14.04357 | 93.098 |
| 14.05318 | 91.926 |
| 14.06338 | 92.949 |
| 14.07358 | 90.676 |
| 14.08318 | 93.166 |
| 14.09337 | 91.574 |
| 14.10355 | 93.065 |
| 14.11313 | 92.765 |
| 14.12331 | 91.862 |
| 14.13348 | 91.389 |
| 14.14305 | 91.567 |
| 14.15321 | 92.323 |
| 14.16336 | 89.934 |
| 14.17351 | 92.717 |
| 14.18306 | 91.734 |
| 14.1932 | 91.35 |
| 14.20334 | 91.807 |
| 14.21347 | 90.548 |
| 14.223 | 92.401 |
| 14.23312 | 91.924 |
| 14.24324 | 89.844 |
| 14.25335 | 90.144 |
| 14.26346 | 91.496 |
| 14.27296 | 90.648 |
| 14.28306 | 92.973 |
| 14.29315 | 91.001 |
| 14.30324 | 90.97 |
| 14.31332 | 91.329 |
| 14.32339 | 91.499 |
| 14.33287 | 93.206 |
| 14.34294 | 88.852 |
| 14.353 | 89.893 |
| 14.36306 | 89.043 |
| 14.37311 | 90.292 |
| 14.38315 | 90.87 |
| 14.3932 | 90.288 |
| 14.40323 | 91.446 |
| 14.41326 | 89.759 |
| 14.42329 | 89.698 |
| 14.43331 | 89.44 |
| 14.44333 | 90.757 |
| 14.45334 | 90.335 |
| 14.46334 | 90.522 |
| 14.47334 | 90.947 |
| 14.48334 | 90.734 |
| 14.49333 | 88.365 |
| 14.50331 | 89.187 |
| 14.51329 | 89.89 |
| 14.52327 | 89.254 |
| 14.53324 | 89.595 |
| 14.5432 | 90.136 |
| 14.55316 | 91.531 |
| 14.56312 | 90.412 |
| 14.57307 | 87.819 |
| 14.58301 | 89.535 |
| 14.59295 | 87.776 |
| 14.60288 | 89.596 |
| 14.61281 | 88.768 |
| 14.62274 | 88.227 |
| 14.63324 | 88.887 |
| 14.64315 | 88.676 |
| 14.65306 | 87.851 |
| 14.66296 | 88.848 |
| 14.67286 | 87.843 |
| 14.68275 | 89.902 |
| 14.69322 | 91.14 |
| 14.7031 | 88.575 |
| 14.71298 | 86.298 |
| 14.72285 | 86.99 |
| 14.73272 | 87.969 |
| 14.74316 | 88.369 |
| 14.75301 | 85.866 |
| 14.76286 | 88.542 |
| 14.77271 | 90.488 |
| 14.78313 | 86.663 |
| 14.79296 | 88.485 |
| 14.80279 | 84.837 |
| 14.81261 | 88.533 |
| 14.82301 | 87.019 |
| 14.83282 | 87.08 |
| 14.84263 | 88.624 |
| 14.85301 | 86.811 |
| 14.86281 | 85.628 |
| 14.8726 | 87.721 |
| 14.88296 | 88.431 |
| 14.89274 | 84.938 |
| 14.90309 | 89.732 |
| 14.91286 | 87.784 |
| 14.92263 | 89.846 |
| 14.93296 | 88.928 |
| 14.94272 | 88.521 |
| 14.95304 | 87.202 |
| 14.96278 | 85.873 |
| 14.97252 | 86.693 |
| 14.98283 | 85.513 |
| 14.99256 | 85.992 |
| 15.00285 | 85.964 |
| 15.01257 | 81.19 |
| 15.02285 | 89.053 |
| 15.03255 | 87.564 |
| 15.04282 | 83.775 |
| 15.05252 | 84.346 |
| 15.06278 | 88.257 |
| 15.07246 | 84.064 |
| 15.08271 | 84.347 |
| 15.09295 | 84.788 |
| 15.10262 | 82.973 |
| 15.11285 | 85.04 |
| 15.12251 | 83.715 |
| 15.13272 | 84.555 |
| 15.14294 | 84.572 |
| 15.15258 | 86.529 |
| 15.16278 | 83.939 |
| 15.17241 | 82.151 |
| 15.1826 | 81.914 |
| 15.19278 | 83.079 |
| 15.20239 | 83.566 |
| 15.21256 | 82.693 |
| 15.22273 | 81.969 |
| 15.23289 | 80.461 |
| 15.24248 | 81.003 |
| 15.25263 | 79.899 |
| 15.26277 | 82.166 |
| 15.2729 | 81.623 |
| 15.28247 | 79.552 |
| 15.29259 | 82.183 |
| 15.30271 | 79.25 |
| 15.31282 | 81.642 |
| 15.32237 | 80.033 |
| 15.33247 | 81.048 |
| 15.34256 | 81.8 |
| 15.35265 | 78.514 |
| 15.36273 | 82.178 |
| 15.37281 | 79.153 |
| 15.38232 | 81.122 |
| 15.39239 | 78.415 |
| 15.40244 | 79.678 |
| 15.4125 | 78.819 |
| 15.42254 | 80.118 |
| 15.43258 | 82.014 |
| 15.44262 | 80.282 |
| 15.45264 | 78.861 |
| 15.46266 | 77.306 |
| 15.47268 | 78.062 |
| 15.48269 | 81.857 |
| 15.49269 | 77.892 |
| 15.50269 | 78.521 |
| 15.51268 | 78.025 |
| 15.52267 | 77.357 |
| 15.53265 | 80.445 |
| 15.54262 | 78.843 |
| 15.55258 | 77.899 |
| 15.56254 | 77.861 |
| 15.5725 | 74.33 |
| 15.58245 | 76.303 |
| 15.59239 | 76.134 |
| 15.60233 | 77.027 |
| 15.61225 | 74.868 |
| 15.62218 | 73.785 |
| 15.63265 | 73.78 |
| 15.64256 | 74.958 |
| 15.65246 | 75.729 |
| 15.66236 | 73.653 |
| 15.67225 | 75.859 |
| 15.68214 | 75.485 |
| 15.69257 | 73.015 |
| 15.70244 | 76.046 |
| 15.71231 | 74.499 |
| 15.72217 | 74.314 |
| 15.73257 | 77.479 |
| 15.74242 | 76.669 |
| 15.75226 | 75.812 |
| 15.7621 | 74.167 |
| 15.77247 | 71.942 |
| 15.7823 | 78.023 |
| 15.79211 | 75.159 |
| 15.80247 | 74.001 |
| 15.81227 | 74.587 |
| 15.82207 | 70.889 |
| 15.8324 | 71.709 |
| 15.84219 | 73.768 |
| 15.85251 | 74.643 |
| 15.86228 | 72.581 |
| 15.87205 | 70.526 |
| 15.88235 | 74.32 |
| 15.8921 | 73.255 |
| 15.90239 | 71.472 |
| 15.91213 | 71.533 |
| 15.9224 | 71.434 |
| 15.93213 | 69.099 |
| 15.94239 | 72.666 |
| 15.95211 | 72.504 |
| 15.96235 | 72.11 |
| 15.97205 | 70.285 |
| 15.98229 | 71.03 |
| 15.99198 | 71.798 |
| 16.0022 | 69.687 |
| 16.01241 | 70.677 |
| 16.02208 | 72.935 |
| 16.03228 | 70.178 |
| 16.04247 | 70.406 |
| 16.05212 | 69.247 |
| 16.06229 | 66.947 |
| 16.07193 | 69.373 |
| 16.08209 | 71.372 |
| 16.09225 | 67.542 |
| 16.1024 | 67.471 |
| 16.11201 | 68.77 |
| 16.12215 | 66.794 |
| 16.13228 | 64.004 |
| 16.1424 | 68.254 |
| 16.15198 | 63.042 |
| 16.16209 | 65.053 |
| 16.17219 | 66.447 |
| 16.18228 | 63.868 |
| 16.19237 | 63.615 |
| 16.20192 | 66.564 |
| 16.21199 | 66.026 |
| 16.22206 | 66.537 |
| 16.23212 | 66.614 |
| 16.24217 | 66.864 |
| 16.25221 | 65.477 |
| 16.26225 | 68.346 |
| 16.27228 | 67.64 |
| 16.2823 | 64.166 |
| 16.29232 | 66.374 |
| 16.3018 | 64.779 |
| 16.3118 | 66.669 |
| 16.3218 | 66.314 |
| 16.33179 | 62.799 |
| 16.34229 | 64.664 |
| 16.35227 | 66.494 |
| 16.36223 | 65.266 |
| 16.37219 | 66.161 |
| 16.38214 | 64.973 |
| 16.39208 | 64.771 |
| 16.40202 | 62.943 |
| 16.41195 | 65.271 |
| 16.42187 | 68.776 |
| 16.43179 | 65.263 |
| 16.44222 | 63.085 |
| 16.45212 | 66.474 |
| 16.46201 | 67.038 |
| 16.4719 | 61.792 |
| 16.48178 | 66.983 |
| 16.49217 | 64.867 |
| 16.50203 | 64.747 |
| 16.51189 | 67.758 |
| 16.52174 | 63.325 |
| 16.53209 | 66.386 |
| 16.54193 | 65.559 |
| 16.55176 | 61.928 |
| 16.56209 | 61.27 |
| 16.5719 | 63.746 |
| 16.58171 | 64.437 |
| 16.59202 | 63.754 |
| 16.60181 | 67.938 |
| 16.61211 | 68.08 |
| 16.62188 | 65.516 |
| 16.63165 | 68.584 |
| 16.64192 | 62.256 |
| 16.65168 | 64.072 |
| 16.66194 | 66.903 |
| 16.67114 | 64.246 |
| 16.68206 | 63.994 |
| 16.69298 | 64.453 |
| 16.70116 | 63.881 |
| 16.71208 | 64.741 |
| 16.723 | 65.009 |
| 16.73119 | 63.456 |
| 16.74211 | 64.223 |
| 16.75302 | 63.671 |
| 16.76121 | 63.614 |
| 16.77213 | 64.62 |
| 16.78304 | 63.806 |
| 16.79123 | 62.468 |
| 16.80215 | 62.761 |
| 16.81306 | 62.794 |
| 16.82125 | 62.762 |
| 16.83216 | 63.141 |
| 16.84308 | 61.878 |
| 16.85126 | 61.794 |
| 16.86217 | 62.169 |
| 16.87309 | 63.354 |
| 16.88127 | 61.864 |
| 16.89219 | 61.68 |
| 16.90037 | 61.73 |
| 16.91128 | 61.178 |
| 16.92219 | 60.911 |
| 16.93038 | 61.535 |
| 16.94129 | 61.039 |
| 16.9522 | 61.204 |
| 16.96038 | 60.431 |
| 16.97129 | 60.626 |
| 16.9822 | 61.436 |
| 16.99039 | 59.642 |
| 17.0013 | 60.248 |
| 17.0122 | 59.036 |
| 17.02039 | 59.729 |
| 17.03129 | 59.421 |
| 17.0422 | 59.538 |
| 17.05038 | 58.974 |
| 17.06129 | 58.853 |
| 17.0722 | 57.776 |
| 17.08038 | 58.551 |
| 17.09129 | 58.998 |
| 17.10219 | 57.793 |
| 17.11037 | 57.864 |
| 17.12128 | 58 |
| 17.13218 | 58.332 |
| 17.14036 | 57.808 |
| 17.15127 | 56.426 |
| 17.16217 | 57.57 |
| 17.17035 | 56.531 |
| 17.18125 | 57.328 |
| 17.19216 | 57.181 |
| 17.20033 | 56.063 |
| 17.21124 | 55.989 |
| 17.22214 | 55.543 |
| 17.23032 | 55.874 |
| 17.24122 | 56.149 |
| 17.25212 | 55.476 |
| 17.2603 | 55.239 |
| 17.2712 | 54.724 |
| 17.2821 | 55.066 |
| 17.29027 | 55.71 |
| 17.30118 | 54.495 |
| 17.31208 | 54.365 |
| 17.32025 | 54.255 |
| 17.33115 | 54.374 |
| 17.34205 | 54.253 |
| 17.35022 | 53.893 |
| 17.36112 | 53.37 |
| 17.37202 | 53.794 |
| 17.38019 | 53.877 |
| 17.39109 | 53.515 |
| 17.40199 | 53.843 |
| 17.41016 | 53.149 |
| 17.42106 | 52.935 |
| 17.43195 | 52.479 |
| 17.44012 | 52.66 |
| 17.45102 | 52.135 |
| 17.46192 | 52.078 |
| 17.47009 | 52.238 |
| 17.48098 | 51.333 |
| 17.49188 | 51.168 |
| 17.50005 | 51.438 |
| 17.51094 | 51.419 |
| 17.52183 | 50.418 |
| 17.53273 | 51.26 |
| 17.5409 | 51.179 |
| 17.55179 | 51.079 |
| 17.56268 | 50.534 |
| 17.57085 | 50.055 |
| 17.58174 | 50.415 |
| 17.59263 | 50.64 |
| 17.6008 | 50.407 |
| 17.61169 | 50.687 |
| 17.62258 | 49.773 |
| 17.63075 | 50.753 |
| 17.64164 | 50.135 |
| 17.65253 | 50.009 |
| 17.66069 | 49.317 |
| 17.67158 | 49.359 |
| 17.68247 | 49.726 |
| 17.69064 | 49.91 |
| 17.70152 | 49.038 |
| 17.71241 | 49.145 |
| 17.72058 | 49.148 |
| 17.73146 | 48.945 |
| 17.74235 | 48.47 |
| 17.75052 | 48.526 |
| 17.7614 | 48.953 |
| 17.77229 | 48.39 |
| 17.78045 | 48.565 |
| 17.79134 | 49.236 |
| 17.80222 | 48.451 |
| 17.81038 | 47.812 |
| 17.82127 | 47.471 |
| 17.83215 | 47.443 |
| 17.84031 | 48.015 |
| 17.8512 | 47.326 |
| 17.86208 | 46.707 |
| 17.87024 | 47.539 |
| 17.88112 | 47.091 |
| 17.892 | 46.817 |
| 17.90017 | 47.958 |
| 17.91105 | 47.562 |
| 17.92193 | 46.964 |
| 17.93009 | 46.892 |
| 17.94097 | 47.029 |
| 17.95185 | 46.898 |
| 17.96001 | 47.526 |
| 17.97089 | 46.243 |
| 17.98177 | 46.866 |
| 17.98992 | 46.425 |
| 18.0008 | 46.498 |
| 18.01168 | 46.12 |
| 18.01984 | 46.344 |
| 18.03072 | 46.201 |
| 18.04159 | 46.299 |
| 18.04975 | 46.037 |
| 18.06063 | 45.813 |
| 18.0715 | 45.227 |
| 18.08238 | 44.712 |
| 18.09053 | 45.182 |
| 18.10141 | 44.898 |
| 18.11228 | 44.762 |
| 18.12044 | 45.072 |
| 18.13131 | 44.205 |
| 18.14219 | 44.757 |
| 18.15034 | 44.925 |
| 18.16121 | 44.817 |
| 18.17209 | 44.222 |
| 18.18024 | 44.102 |
| 18.19111 | 43.981 |
| 18.20199 | 44.041 |
| 18.21014 | 44.233 |
| 18.22101 | 43.952 |
| 18.23188 | 43.088 |
| 18.24003 | 43.356 |
| 18.2509 | 43.408 |
| 18.26177 | 43.051 |
| 18.26992 | 42.846 |
| 18.28079 | 43.211 |
| 18.29166 | 42.827 |
| 18.29981 | 42.712 |
| 18.31068 | 43.269 |
| 18.32155 | 42.337 |
| 18.3297 | 42.321 |
| 18.34057 | 42.322 |
| 18.35143 | 42.296 |
| 18.35958 | 41.69 |
| 18.37045 | 41.752 |
| 18.38132 | 42.035 |
| 18.39218 | 41.562 |
| 18.40033 | 41.293 |
| 18.4112 | 41.284 |
| 18.42206 | 41.406 |
| 18.43021 | 41.307 |
| 18.44107 | 41.149 |
| 18.45193 | 40.957 |
| 18.46008 | 40.914 |
| 18.47094 | 40.75 |
| 18.48181 | 40.509 |
| 18.48995 | 40.535 |
| 18.50082 | 39.19 |
| 18.51168 | 40.369 |
| 18.51982 | 40.003 |
| 18.53068 | 39.254 |
| 18.54154 | 39.527 |
| 18.54969 | 39.665 |
| 18.56055 | 39.012 |
| 18.57141 | 39.639 |
| 18.57955 | 39.151 |
| 18.59041 | 39.053 |
| 18.60127 | 38.877 |
| 18.61213 | 37.784 |
| 18.62027 | 38.895 |
| 18.63113 | 38.416 |
| 18.64199 | 38.338 |
| 18.65013 | 38.308 |
| 18.66099 | 37.753 |
| 18.67184 | 37.883 |
| 18.67998 | 37.735 |
| 18.69084 | 37.005 |
| 18.70169 | 37.166 |
| 18.70984 | 36.866 |
| 18.72069 | 37.156 |
| 18.73154 | 36.53 |
| 18.73968 | 36.008 |
| 18.75054 | 36.072 |
| 18.76139 | 37.107 |
| 18.76953 | 36.308 |
| 18.78038 | 36.645 |
| 18.79124 | 36.44 |
| 18.79937 | 35.843 |
| 18.81023 | 35.336 |
| 18.82108 | 35.512 |
| 18.83193 | 35.055 |
| 18.84006 | 35.132 |
| 18.85092 | 34.825 |
| 18.86176 | 35.623 |
| 18.8699 | 35.165 |
| 18.88075 | 35.276 |
| 18.8916 | 34.427 |
| 18.89974 | 34.027 |
| 18.91058 | 34.622 |
| 18.92143 | 34.119 |
| 18.92957 | 33.697 |
| 18.94041 | 33.336 |
| 18.95126 | 33.313 |
| 18.9594 | 33.127 |
| 18.97024 | 32.895 |
| 18.98109 | 33.162 |
| 18.98922 | 32.782 |
| 19.00007 | 32.685 |
| 19.01091 | 33.149 |
| 19.02176 | 31.762 |
| 19.02989 | 31.685 |
| 19.04073 | 32.039 |
| 19.05158 | 31.982 |
| 19.05971 | 31.612 |
| 19.07055 | 31.148 |
| 19.08139 | 31.082 |
| 19.08952 | 30.1 |
| 19.10037 | 30.505 |
| 19.11121 | 31.124 |
| 19.11934 | 30.12 |
| 19.13018 | 30.206 |
| 19.14102 | 29.95 |
| 19.14915 | 29.847 |
| 19.15999 | 29.952 |
| 19.17083 | 29.877 |
| 19.18167 | 29.223 |
| 19.18979 | 29.724 |
| 19.20063 | 29.548 |
| 19.21147 | 28.921 |
| 19.2196 | 28.851 |
| 19.23043 | 28.459 |
| 19.24127 | 27.68 |
| 19.2494 | 28.818 |
| 19.26023 | 27.839 |
| 19.27107 | 28.052 |
| 19.2792 | 27.554 |
| 19.29003 | 27.19 |
| 19.30087 | 27.689 |
| 19.3117 | 26.699 |
| 19.31983 | 26.302 |
| 19.33066 | 26.404 |
| 19.34149 | 26.537 |
| 19.34962 | 26.31 |
| 19.36045 | 26.577 |
| 19.37128 | 25.881 |
| 19.37941 | 25.849 |
| 19.39024 | 25.806 |
| 19.40107 | 25.606 |
| 19.40919 | 25.042 |
| 19.42002 | 24.836 |
| 19.43085 | 24.379 |
| 19.43898 | 24.669 |
| 19.44981 | 24.471 |
| 19.46063 | 24.103 |
| 19.47146 | 23.922 |
| 19.47958 | 23.686 |
| 19.49041 | 23.296 |
| 19.50124 | 23.39 |
| 19.50936 | 23.659 |
| 19.52019 | 23.692 |
| 19.53101 | 23.046 |
| 19.53913 | 22.259 |
| 19.54996 | 22.487 |
| 19.56079 | 22.098 |
| 19.5689 | 22.164 |
| 19.57973 | 22.439 |
| 19.59055 | 22.255 |
| 19.60138 | 21.499 |
| 19.6095 | 21.064 |
| 19.62032 | 21.149 |
| 19.63114 | 21.519 |
| 19.63926 | 20.935 |
| 19.65008 | 20.35 |
| 19.6609 | 20.547 |
| 19.66902 | 20.214 |
| 19.67984 | 19.572 |
| 19.69066 | 19.839 |
| 19.70148 | 19.506 |
| 19.7096 | 19.863 |
| 19.72042 | 18.843 |
| 19.73124 | 19.04 |
| 19.73935 | 18.49 |
| 19.75017 | 18.363 |
| 19.76099 | 18.162 |
| 19.7691 | 17.977 |
| 19.77992 | 17.762 |
| 19.79074 | 17.924 |
| 19.79885 | 17.813 |
| 19.80967 | 16.817 |
| 19.82048 | 17.301 |
| 19.8313 | 16.57 |
| 19.83941 | 15.993 |
| 19.85023 | 16.238 |
| 19.86104 | 16.532 |
| 19.86915 | 16.118 |
| 19.87997 | 16.425 |
| 19.89078 | 15.424 |
| 19.89889 | 15.85 |
| 19.9097 | 15.147 |
| 19.92052 | 15.504 |
| 19.93133 | 14.168 |
| 19.93944 | 15.122 |
| 19.95025 | 15.361 |
| 19.96106 | 14.915 |
| 19.96917 | 14.031 |
| 19.97998 | 14.067 |
| 19.99079 | 13.968 |
| 19.9989 | 13.506 |